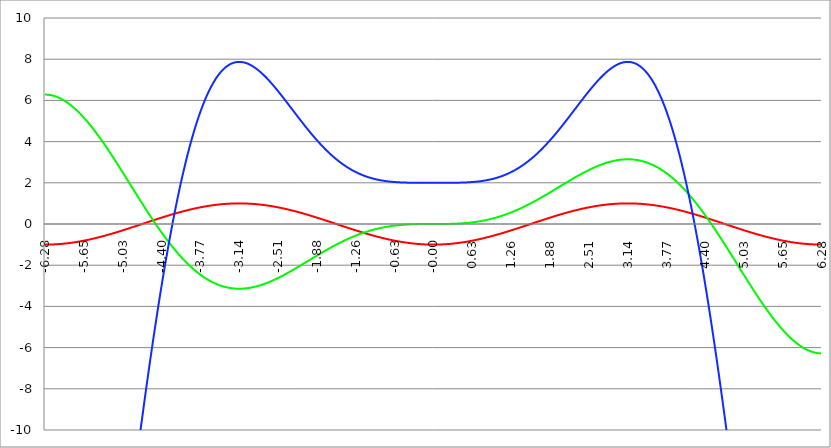
| Category | Series 1 | Series 0 | Series 2 |
|---|---|---|---|
| -6.283185307179586 | -1 | 6.283 | -37.478 |
| -6.276902121872407 | -1 | 6.283 | -37.478 |
| -6.270618936565228 | -1 | 6.283 | -37.475 |
| -6.264335751258049 | -1 | 6.282 | -37.471 |
| -6.25805256595087 | -1 | 6.281 | -37.466 |
| -6.25176938064369 | -1 | 6.28 | -37.459 |
| -6.245486195336511 | -0.999 | 6.279 | -37.451 |
| -6.23920301002933 | -0.999 | 6.277 | -37.441 |
| -6.232919824722153 | -0.999 | 6.275 | -37.429 |
| -6.226636639414973 | -0.998 | 6.273 | -37.416 |
| -6.220353454107794 | -0.998 | 6.271 | -37.402 |
| -6.214070268800615 | -0.998 | 6.268 | -37.386 |
| -6.207787083493435 | -0.997 | 6.265 | -37.368 |
| -6.201503898186257 | -0.997 | 6.262 | -37.349 |
| -6.195220712879077 | -0.996 | 6.259 | -37.329 |
| -6.188937527571898 | -0.996 | 6.256 | -37.307 |
| -6.182654342264719 | -0.995 | 6.252 | -37.283 |
| -6.17637115695754 | -0.994 | 6.248 | -37.258 |
| -6.170087971650361 | -0.994 | 6.244 | -37.232 |
| -6.163804786343182 | -0.993 | 6.239 | -37.204 |
| -6.157521601036002 | -0.992 | 6.234 | -37.175 |
| -6.151238415728823 | -0.991 | 6.229 | -37.145 |
| -6.144955230421644 | -0.99 | 6.224 | -37.113 |
| -6.138672045114464 | -0.99 | 6.219 | -37.079 |
| -6.132388859807286 | -0.989 | 6.213 | -37.045 |
| -6.126105674500106 | -0.988 | 6.207 | -37.008 |
| -6.119822489192927 | -0.987 | 6.201 | -36.971 |
| -6.113539303885748 | -0.986 | 6.195 | -36.932 |
| -6.107256118578569 | -0.985 | 6.188 | -36.892 |
| -6.10097293327139 | -0.983 | 6.181 | -36.85 |
| -6.09468974796421 | -0.982 | 6.174 | -36.807 |
| -6.088406562657031 | -0.981 | 6.167 | -36.762 |
| -6.082123377349852 | -0.98 | 6.159 | -36.717 |
| -6.075840192042672 | -0.979 | 6.152 | -36.67 |
| -6.069557006735494 | -0.977 | 6.144 | -36.621 |
| -6.063273821428314 | -0.976 | 6.135 | -36.571 |
| -6.056990636121135 | -0.975 | 6.127 | -36.52 |
| -6.050707450813956 | -0.973 | 6.118 | -36.468 |
| -6.044424265506777 | -0.972 | 6.109 | -36.414 |
| -6.038141080199597 | -0.97 | 6.1 | -36.359 |
| -6.031857894892418 | -0.969 | 6.091 | -36.303 |
| -6.025574709585239 | -0.967 | 6.082 | -36.246 |
| -6.01929152427806 | -0.965 | 6.072 | -36.187 |
| -6.013008338970881 | -0.964 | 6.062 | -36.127 |
| -6.006725153663701 | -0.962 | 6.052 | -36.066 |
| -6.000441968356522 | -0.96 | 6.041 | -36.003 |
| -5.994158783049343 | -0.959 | 6.031 | -35.939 |
| -5.987875597742164 | -0.957 | 6.02 | -35.875 |
| -5.981592412434984 | -0.955 | 6.009 | -35.808 |
| -5.975309227127805 | -0.953 | 5.997 | -35.741 |
| -5.969026041820626 | -0.951 | 5.986 | -35.672 |
| -5.962742856513447 | -0.949 | 5.974 | -35.603 |
| -5.956459671206268 | -0.947 | 5.962 | -35.532 |
| -5.950176485899088 | -0.945 | 5.95 | -35.46 |
| -5.94389330059191 | -0.943 | 5.938 | -35.386 |
| -5.93761011528473 | -0.941 | 5.925 | -35.312 |
| -5.931326929977551 | -0.939 | 5.913 | -35.236 |
| -5.925043744670372 | -0.937 | 5.9 | -35.159 |
| -5.918760559363193 | -0.934 | 5.886 | -35.082 |
| -5.912477374056014 | -0.932 | 5.873 | -35.003 |
| -5.906194188748834 | -0.93 | 5.86 | -34.922 |
| -5.899911003441655 | -0.927 | 5.846 | -34.841 |
| -5.893627818134476 | -0.925 | 5.832 | -34.759 |
| -5.887344632827297 | -0.923 | 5.818 | -34.675 |
| -5.881061447520117 | -0.92 | 5.803 | -34.591 |
| -5.874778262212938 | -0.918 | 5.789 | -34.505 |
| -5.868495076905759 | -0.915 | 5.774 | -34.419 |
| -5.86221189159858 | -0.913 | 5.759 | -34.331 |
| -5.855928706291401 | -0.91 | 5.744 | -34.242 |
| -5.849645520984221 | -0.907 | 5.729 | -34.152 |
| -5.843362335677042 | -0.905 | 5.713 | -34.062 |
| -5.837079150369863 | -0.902 | 5.697 | -33.97 |
| -5.830795965062684 | -0.899 | 5.681 | -33.877 |
| -5.824512779755505 | -0.897 | 5.665 | -33.783 |
| -5.818229594448325 | -0.894 | 5.649 | -33.688 |
| -5.811946409141146 | -0.891 | 5.632 | -33.592 |
| -5.805663223833967 | -0.888 | 5.616 | -33.495 |
| -5.799380038526788 | -0.885 | 5.599 | -33.398 |
| -5.793096853219609 | -0.882 | 5.582 | -33.299 |
| -5.78681366791243 | -0.879 | 5.565 | -33.199 |
| -5.780530482605251 | -0.876 | 5.547 | -33.098 |
| -5.774247297298071 | -0.873 | 5.53 | -32.997 |
| -5.767964111990892 | -0.87 | 5.512 | -32.894 |
| -5.761680926683713 | -0.867 | 5.494 | -32.791 |
| -5.755397741376534 | -0.864 | 5.476 | -32.686 |
| -5.749114556069355 | -0.861 | 5.458 | -32.581 |
| -5.742831370762175 | -0.858 | 5.439 | -32.475 |
| -5.736548185454996 | -0.854 | 5.42 | -32.368 |
| -5.730265000147816 | -0.851 | 5.402 | -32.26 |
| -5.723981814840638 | -0.848 | 5.383 | -32.151 |
| -5.717698629533459 | -0.844 | 5.363 | -32.042 |
| -5.711415444226279 | -0.841 | 5.344 | -31.931 |
| -5.7051322589191 | -0.838 | 5.325 | -31.82 |
| -5.698849073611921 | -0.834 | 5.305 | -31.708 |
| -5.692565888304742 | -0.831 | 5.285 | -31.595 |
| -5.686282702997562 | -0.827 | 5.265 | -31.481 |
| -5.679999517690383 | -0.824 | 5.245 | -31.366 |
| -5.673716332383204 | -0.82 | 5.225 | -31.251 |
| -5.667433147076025 | -0.816 | 5.204 | -31.135 |
| -5.661149961768846 | -0.813 | 5.183 | -31.018 |
| -5.654866776461667 | -0.809 | 5.163 | -30.9 |
| -5.648583591154487 | -0.805 | 5.142 | -30.782 |
| -5.642300405847308 | -0.802 | 5.121 | -30.662 |
| -5.63601722054013 | -0.798 | 5.099 | -30.542 |
| -5.62973403523295 | -0.794 | 5.078 | -30.422 |
| -5.623450849925771 | -0.79 | 5.056 | -30.3 |
| -5.617167664618591 | -0.786 | 5.035 | -30.178 |
| -5.610884479311412 | -0.782 | 5.013 | -30.055 |
| -5.604601294004233 | -0.778 | 4.991 | -29.932 |
| -5.598318108697054 | -0.775 | 4.968 | -29.807 |
| -5.592034923389875 | -0.771 | 4.946 | -29.683 |
| -5.585751738082695 | -0.766 | 4.924 | -29.557 |
| -5.579468552775516 | -0.762 | 4.901 | -29.431 |
| -5.573185367468337 | -0.758 | 4.878 | -29.304 |
| -5.566902182161157 | -0.754 | 4.855 | -29.176 |
| -5.560618996853979 | -0.75 | 4.832 | -29.048 |
| -5.5543358115468 | -0.746 | 4.809 | -28.919 |
| -5.54805262623962 | -0.742 | 4.786 | -28.79 |
| -5.54176944093244 | -0.738 | 4.762 | -28.66 |
| -5.535486255625262 | -0.733 | 4.739 | -28.529 |
| -5.529203070318083 | -0.729 | 4.715 | -28.398 |
| -5.522919885010904 | -0.725 | 4.691 | -28.266 |
| -5.516636699703724 | -0.72 | 4.667 | -28.134 |
| -5.510353514396545 | -0.716 | 4.643 | -28.001 |
| -5.504070329089366 | -0.712 | 4.619 | -27.868 |
| -5.497787143782186 | -0.707 | 4.595 | -27.734 |
| -5.491503958475008 | -0.703 | 4.57 | -27.599 |
| -5.485220773167828 | -0.698 | 4.546 | -27.464 |
| -5.47893758786065 | -0.694 | 4.521 | -27.328 |
| -5.47265440255347 | -0.689 | 4.496 | -27.192 |
| -5.466371217246291 | -0.685 | 4.471 | -27.056 |
| -5.460088031939112 | -0.68 | 4.446 | -26.919 |
| -5.453804846631932 | -0.675 | 4.421 | -26.781 |
| -5.447521661324753 | -0.671 | 4.395 | -26.643 |
| -5.441238476017574 | -0.666 | 4.37 | -26.504 |
| -5.434955290710395 | -0.661 | 4.344 | -26.365 |
| -5.428672105403215 | -0.657 | 4.319 | -26.226 |
| -5.422388920096036 | -0.652 | 4.293 | -26.086 |
| -5.416105734788857 | -0.647 | 4.267 | -25.946 |
| -5.409822549481678 | -0.642 | 4.241 | -25.805 |
| -5.403539364174499 | -0.637 | 4.215 | -25.664 |
| -5.39725617886732 | -0.633 | 4.189 | -25.522 |
| -5.39097299356014 | -0.628 | 4.162 | -25.38 |
| -5.384689808252961 | -0.623 | 4.136 | -25.238 |
| -5.378406622945782 | -0.618 | 4.109 | -25.095 |
| -5.372123437638603 | -0.613 | 4.083 | -24.952 |
| -5.365840252331424 | -0.608 | 4.056 | -24.809 |
| -5.359557067024244 | -0.603 | 4.029 | -24.665 |
| -5.353273881717065 | -0.598 | 4.002 | -24.521 |
| -5.346990696409886 | -0.593 | 3.975 | -24.376 |
| -5.340707511102707 | -0.588 | 3.948 | -24.231 |
| -5.334424325795528 | -0.583 | 3.921 | -24.086 |
| -5.328141140488348 | -0.578 | 3.894 | -23.941 |
| -5.32185795518117 | -0.572 | 3.866 | -23.795 |
| -5.31557476987399 | -0.567 | 3.839 | -23.649 |
| -5.30929158456681 | -0.562 | 3.811 | -23.503 |
| -5.303008399259631 | -0.557 | 3.784 | -23.356 |
| -5.296725213952453 | -0.552 | 3.756 | -23.209 |
| -5.290442028645273 | -0.546 | 3.728 | -23.062 |
| -5.284158843338094 | -0.541 | 3.7 | -22.914 |
| -5.277875658030915 | -0.536 | 3.672 | -22.767 |
| -5.271592472723735 | -0.531 | 3.644 | -22.619 |
| -5.265309287416557 | -0.525 | 3.616 | -22.471 |
| -5.259026102109377 | -0.52 | 3.588 | -22.322 |
| -5.252742916802198 | -0.514 | 3.56 | -22.174 |
| -5.246459731495019 | -0.509 | 3.531 | -22.025 |
| -5.24017654618784 | -0.504 | 3.503 | -21.876 |
| -5.23389336088066 | -0.498 | 3.475 | -21.727 |
| -5.227610175573481 | -0.493 | 3.446 | -21.578 |
| -5.221326990266302 | -0.487 | 3.417 | -21.428 |
| -5.215043804959122 | -0.482 | 3.389 | -21.279 |
| -5.208760619651944 | -0.476 | 3.36 | -21.129 |
| -5.202477434344764 | -0.471 | 3.331 | -20.979 |
| -5.196194249037585 | -0.465 | 3.302 | -20.829 |
| -5.189911063730406 | -0.46 | 3.273 | -20.678 |
| -5.183627878423227 | -0.454 | 3.244 | -20.528 |
| -5.177344693116048 | -0.448 | 3.215 | -20.378 |
| -5.171061507808868 | -0.443 | 3.186 | -20.227 |
| -5.164778322501689 | -0.437 | 3.157 | -20.076 |
| -5.15849513719451 | -0.431 | 3.128 | -19.925 |
| -5.152211951887331 | -0.426 | 3.099 | -19.775 |
| -5.145928766580152 | -0.42 | 3.069 | -19.624 |
| -5.139645581272972 | -0.414 | 3.04 | -19.473 |
| -5.133362395965793 | -0.409 | 3.01 | -19.322 |
| -5.127079210658614 | -0.403 | 2.981 | -19.17 |
| -5.120796025351435 | -0.397 | 2.951 | -19.019 |
| -5.114512840044256 | -0.391 | 2.922 | -18.868 |
| -5.108229654737076 | -0.386 | 2.892 | -18.717 |
| -5.101946469429897 | -0.38 | 2.863 | -18.565 |
| -5.095663284122718 | -0.374 | 2.833 | -18.414 |
| -5.08938009881554 | -0.368 | 2.803 | -18.263 |
| -5.08309691350836 | -0.362 | 2.774 | -18.111 |
| -5.07681372820118 | -0.356 | 2.744 | -17.96 |
| -5.070530542894002 | -0.351 | 2.714 | -17.809 |
| -5.064247357586822 | -0.345 | 2.684 | -17.658 |
| -5.057964172279643 | -0.339 | 2.654 | -17.506 |
| -5.051680986972464 | -0.333 | 2.624 | -17.355 |
| -5.045397801665285 | -0.327 | 2.594 | -17.204 |
| -5.039114616358106 | -0.321 | 2.564 | -17.053 |
| -5.032831431050926 | -0.315 | 2.534 | -16.902 |
| -5.026548245743747 | -0.309 | 2.504 | -16.751 |
| -5.020265060436568 | -0.303 | 2.474 | -16.6 |
| -5.013981875129389 | -0.297 | 2.444 | -16.449 |
| -5.00769868982221 | -0.291 | 2.414 | -16.298 |
| -5.00141550451503 | -0.285 | 2.384 | -16.147 |
| -4.995132319207851 | -0.279 | 2.354 | -15.997 |
| -4.98884913390067 | -0.273 | 2.324 | -15.846 |
| -4.982565948593493 | -0.267 | 2.294 | -15.696 |
| -4.976282763286313 | -0.261 | 2.263 | -15.546 |
| -4.969999577979134 | -0.255 | 2.233 | -15.396 |
| -4.963716392671955 | -0.249 | 2.203 | -15.246 |
| -4.957433207364776 | -0.243 | 2.173 | -15.096 |
| -4.951150022057597 | -0.236 | 2.143 | -14.946 |
| -4.944866836750418 | -0.23 | 2.112 | -14.796 |
| -4.938583651443238 | -0.224 | 2.082 | -14.647 |
| -4.932300466136059 | -0.218 | 2.052 | -14.498 |
| -4.92601728082888 | -0.212 | 2.022 | -14.349 |
| -4.9197340955217 | -0.206 | 1.991 | -14.2 |
| -4.913450910214521 | -0.2 | 1.961 | -14.051 |
| -4.907167724907342 | -0.194 | 1.931 | -13.902 |
| -4.900884539600163 | -0.187 | 1.901 | -13.754 |
| -4.894601354292984 | -0.181 | 1.87 | -13.606 |
| -4.888318168985805 | -0.175 | 1.84 | -13.458 |
| -4.882034983678625 | -0.169 | 1.81 | -13.31 |
| -4.875751798371446 | -0.163 | 1.78 | -13.163 |
| -4.869468613064267 | -0.156 | 1.749 | -13.015 |
| -4.863185427757088 | -0.15 | 1.719 | -12.868 |
| -4.856902242449909 | -0.144 | 1.689 | -12.722 |
| -4.85061905714273 | -0.138 | 1.659 | -12.575 |
| -4.84433587183555 | -0.132 | 1.629 | -12.429 |
| -4.838052686528371 | -0.125 | 1.598 | -12.283 |
| -4.831769501221192 | -0.119 | 1.568 | -12.137 |
| -4.825486315914013 | -0.113 | 1.538 | -11.991 |
| -4.819203130606833 | -0.107 | 1.508 | -11.846 |
| -4.812919945299654 | -0.1 | 1.478 | -11.701 |
| -4.806636759992475 | -0.094 | 1.448 | -11.557 |
| -4.800353574685296 | -0.088 | 1.418 | -11.412 |
| -4.794070389378117 | -0.082 | 1.388 | -11.268 |
| -4.787787204070938 | -0.075 | 1.358 | -11.124 |
| -4.781504018763758 | -0.069 | 1.328 | -10.981 |
| -4.77522083345658 | -0.063 | 1.298 | -10.838 |
| -4.7689376481494 | -0.057 | 1.268 | -10.695 |
| -4.762654462842221 | -0.05 | 1.238 | -10.552 |
| -4.756371277535042 | -0.044 | 1.208 | -10.41 |
| -4.750088092227862 | -0.038 | 1.178 | -10.268 |
| -4.743804906920683 | -0.031 | 1.149 | -10.127 |
| -4.737521721613504 | -0.025 | 1.119 | -9.986 |
| -4.731238536306324 | -0.019 | 1.089 | -9.845 |
| -4.724955350999146 | -0.013 | 1.059 | -9.705 |
| -4.718672165691966 | -0.006 | 1.03 | -9.564 |
| -4.712388980384787 | 0 | 1 | -9.425 |
| -4.706105795077608 | 0.006 | 0.97 | -9.285 |
| -4.699822609770429 | 0.013 | 0.941 | -9.146 |
| -4.69353942446325 | 0.019 | 0.911 | -9.008 |
| -4.68725623915607 | 0.025 | 0.882 | -8.87 |
| -4.680973053848891 | 0.031 | 0.852 | -8.732 |
| -4.674689868541712 | 0.038 | 0.823 | -8.594 |
| -4.668406683234533 | 0.044 | 0.794 | -8.457 |
| -4.662123497927354 | 0.05 | 0.764 | -8.321 |
| -4.655840312620174 | 0.057 | 0.735 | -8.185 |
| -4.649557127312995 | 0.063 | 0.706 | -8.049 |
| -4.643273942005816 | 0.069 | 0.677 | -7.914 |
| -4.636990756698637 | 0.075 | 0.648 | -7.779 |
| -4.630707571391458 | 0.082 | 0.619 | -7.644 |
| -4.624424386084279 | 0.088 | 0.59 | -7.51 |
| -4.618141200777099 | 0.094 | 0.561 | -7.376 |
| -4.61185801546992 | 0.1 | 0.532 | -7.243 |
| -4.605574830162741 | 0.107 | 0.503 | -7.111 |
| -4.599291644855561 | 0.113 | 0.475 | -6.978 |
| -4.593008459548383 | 0.119 | 0.446 | -6.846 |
| -4.586725274241203 | 0.125 | 0.417 | -6.715 |
| -4.580442088934024 | 0.132 | 0.389 | -6.584 |
| -4.574158903626845 | 0.138 | 0.36 | -6.454 |
| -4.567875718319666 | 0.144 | 0.332 | -6.324 |
| -4.561592533012487 | 0.15 | 0.303 | -6.194 |
| -4.555309347705307 | 0.156 | 0.275 | -6.065 |
| -4.549026162398128 | 0.163 | 0.247 | -5.937 |
| -4.542742977090949 | 0.169 | 0.219 | -5.809 |
| -4.53645979178377 | 0.175 | 0.191 | -5.681 |
| -4.530176606476591 | 0.181 | 0.163 | -5.554 |
| -4.523893421169412 | 0.187 | 0.135 | -5.427 |
| -4.517610235862232 | 0.194 | 0.107 | -5.301 |
| -4.511327050555053 | 0.2 | 0.079 | -5.176 |
| -4.505043865247874 | 0.206 | 0.051 | -5.051 |
| -4.498760679940694 | 0.212 | 0.023 | -4.926 |
| -4.492477494633515 | 0.218 | -0.004 | -4.802 |
| -4.486194309326336 | 0.224 | -0.032 | -4.679 |
| -4.479911124019157 | 0.23 | -0.059 | -4.556 |
| -4.473627938711977 | 0.236 | -0.086 | -4.433 |
| -4.467344753404799 | 0.243 | -0.114 | -4.311 |
| -4.46106156809762 | 0.249 | -0.141 | -4.19 |
| -4.45477838279044 | 0.255 | -0.168 | -4.069 |
| -4.44849519748326 | 0.261 | -0.195 | -3.949 |
| -4.442212012176082 | 0.267 | -0.222 | -3.829 |
| -4.435928826868903 | 0.273 | -0.249 | -3.71 |
| -4.429645641561723 | 0.279 | -0.276 | -3.591 |
| -4.423362456254544 | 0.285 | -0.302 | -3.473 |
| -4.417079270947365 | 0.291 | -0.329 | -3.356 |
| -4.410796085640185 | 0.297 | -0.355 | -3.239 |
| -4.404512900333007 | 0.303 | -0.382 | -3.122 |
| -4.398229715025827 | 0.309 | -0.408 | -3.006 |
| -4.391946529718648 | 0.315 | -0.434 | -2.891 |
| -4.38566334441147 | 0.321 | -0.46 | -2.776 |
| -4.37938015910429 | 0.327 | -0.487 | -2.662 |
| -4.373096973797111 | 0.333 | -0.512 | -2.548 |
| -4.366813788489932 | 0.339 | -0.538 | -2.435 |
| -4.360530603182752 | 0.345 | -0.564 | -2.323 |
| -4.354247417875573 | 0.351 | -0.59 | -2.211 |
| -4.347964232568394 | 0.356 | -0.615 | -2.1 |
| -4.341681047261215 | 0.362 | -0.641 | -1.989 |
| -4.335397861954035 | 0.368 | -0.666 | -1.879 |
| -4.329114676646856 | 0.374 | -0.691 | -1.769 |
| -4.322831491339677 | 0.38 | -0.717 | -1.661 |
| -4.316548306032498 | 0.386 | -0.742 | -1.552 |
| -4.310265120725319 | 0.391 | -0.767 | -1.445 |
| -4.30398193541814 | 0.397 | -0.792 | -1.337 |
| -4.29769875011096 | 0.403 | -0.816 | -1.231 |
| -4.291415564803781 | 0.409 | -0.841 | -1.125 |
| -4.285132379496602 | 0.414 | -0.866 | -1.02 |
| -4.278849194189422 | 0.42 | -0.89 | -0.915 |
| -4.272566008882244 | 0.426 | -0.914 | -0.811 |
| -4.266282823575064 | 0.431 | -0.939 | -0.707 |
| -4.259999638267885 | 0.437 | -0.963 | -0.605 |
| -4.253716452960706 | 0.443 | -0.987 | -0.502 |
| -4.247433267653527 | 0.448 | -1.011 | -0.401 |
| -4.241150082346347 | 0.454 | -1.034 | -0.3 |
| -4.234866897039168 | 0.46 | -1.058 | -0.199 |
| -4.228583711731989 | 0.465 | -1.082 | -0.1 |
| -4.22230052642481 | 0.471 | -1.105 | 0 |
| -4.216017341117631 | 0.476 | -1.129 | 0.098 |
| -4.209734155810452 | 0.482 | -1.152 | 0.196 |
| -4.203450970503273 | 0.487 | -1.175 | 0.293 |
| -4.197167785196093 | 0.493 | -1.198 | 0.39 |
| -4.190884599888914 | 0.498 | -1.221 | 0.486 |
| -4.184601414581734 | 0.504 | -1.244 | 0.581 |
| -4.178318229274556 | 0.509 | -1.266 | 0.676 |
| -4.172035043967377 | 0.514 | -1.289 | 0.77 |
| -4.165751858660197 | 0.52 | -1.311 | 0.864 |
| -4.159468673353018 | 0.525 | -1.333 | 0.956 |
| -4.153185488045839 | 0.531 | -1.356 | 1.049 |
| -4.14690230273866 | 0.536 | -1.378 | 1.14 |
| -4.140619117431481 | 0.541 | -1.4 | 1.231 |
| -4.134335932124301 | 0.546 | -1.421 | 1.321 |
| -4.128052746817122 | 0.552 | -1.443 | 1.411 |
| -4.121769561509943 | 0.557 | -1.465 | 1.5 |
| -4.115486376202764 | 0.562 | -1.486 | 1.588 |
| -4.109203190895584 | 0.567 | -1.507 | 1.676 |
| -4.102920005588405 | 0.572 | -1.529 | 1.763 |
| -4.096636820281226 | 0.578 | -1.55 | 1.849 |
| -4.090353634974047 | 0.583 | -1.571 | 1.935 |
| -4.084070449666868 | 0.588 | -1.592 | 2.02 |
| -4.077787264359689 | 0.593 | -1.612 | 2.105 |
| -4.071504079052509 | 0.598 | -1.633 | 2.189 |
| -4.06522089374533 | 0.603 | -1.653 | 2.272 |
| -4.058937708438151 | 0.608 | -1.674 | 2.354 |
| -4.052654523130972 | 0.613 | -1.694 | 2.436 |
| -4.046371337823793 | 0.618 | -1.714 | 2.517 |
| -4.040088152516613 | 0.623 | -1.734 | 2.598 |
| -4.033804967209434 | 0.628 | -1.754 | 2.678 |
| -4.027521781902255 | 0.633 | -1.773 | 2.757 |
| -4.021238596595076 | 0.637 | -1.793 | 2.836 |
| -4.014955411287897 | 0.642 | -1.812 | 2.914 |
| -4.008672225980717 | 0.647 | -1.831 | 2.991 |
| -4.002389040673538 | 0.652 | -1.851 | 3.068 |
| -3.996105855366359 | 0.657 | -1.87 | 3.144 |
| -3.989822670059179 | 0.661 | -1.888 | 3.219 |
| -3.983539484752 | 0.666 | -1.907 | 3.294 |
| -3.97725629944482 | 0.671 | -1.926 | 3.368 |
| -3.97097311413764 | 0.675 | -1.944 | 3.441 |
| -3.96468992883046 | 0.68 | -1.963 | 3.514 |
| -3.958406743523281 | 0.685 | -1.981 | 3.586 |
| -3.952123558216101 | 0.689 | -1.999 | 3.657 |
| -3.945840372908922 | 0.694 | -2.017 | 3.728 |
| -3.939557187601742 | 0.698 | -2.035 | 3.798 |
| -3.933274002294562 | 0.703 | -2.052 | 3.868 |
| -3.926990816987382 | 0.707 | -2.07 | 3.937 |
| -3.920707631680203 | 0.712 | -2.087 | 4.005 |
| -3.914424446373023 | 0.716 | -2.104 | 4.072 |
| -3.908141261065844 | 0.72 | -2.121 | 4.139 |
| -3.901858075758664 | 0.725 | -2.138 | 4.206 |
| -3.895574890451484 | 0.729 | -2.155 | 4.271 |
| -3.889291705144305 | 0.733 | -2.172 | 4.336 |
| -3.883008519837125 | 0.738 | -2.188 | 4.4 |
| -3.876725334529945 | 0.742 | -2.205 | 4.464 |
| -3.870442149222766 | 0.746 | -2.221 | 4.527 |
| -3.864158963915586 | 0.75 | -2.237 | 4.589 |
| -3.857875778608407 | 0.754 | -2.253 | 4.651 |
| -3.851592593301227 | 0.758 | -2.269 | 4.712 |
| -3.845309407994047 | 0.762 | -2.285 | 4.773 |
| -3.839026222686868 | 0.766 | -2.3 | 4.832 |
| -3.832743037379688 | 0.771 | -2.316 | 4.892 |
| -3.826459852072508 | 0.775 | -2.331 | 4.95 |
| -3.820176666765329 | 0.778 | -2.346 | 5.008 |
| -3.813893481458149 | 0.782 | -2.361 | 5.065 |
| -3.807610296150969 | 0.786 | -2.376 | 5.122 |
| -3.80132711084379 | 0.79 | -2.391 | 5.178 |
| -3.79504392553661 | 0.794 | -2.405 | 5.233 |
| -3.78876074022943 | 0.798 | -2.42 | 5.288 |
| -3.782477554922251 | 0.802 | -2.434 | 5.342 |
| -3.776194369615071 | 0.805 | -2.448 | 5.395 |
| -3.769911184307892 | 0.809 | -2.462 | 5.448 |
| -3.763627999000712 | 0.813 | -2.476 | 5.5 |
| -3.757344813693532 | 0.816 | -2.49 | 5.552 |
| -3.751061628386352 | 0.82 | -2.503 | 5.603 |
| -3.744778443079173 | 0.824 | -2.517 | 5.653 |
| -3.738495257771993 | 0.827 | -2.53 | 5.703 |
| -3.732212072464814 | 0.831 | -2.543 | 5.752 |
| -3.725928887157634 | 0.834 | -2.556 | 5.8 |
| -3.719645701850454 | 0.838 | -2.569 | 5.848 |
| -3.713362516543275 | 0.841 | -2.582 | 5.895 |
| -3.707079331236095 | 0.844 | -2.594 | 5.942 |
| -3.700796145928915 | 0.848 | -2.607 | 5.988 |
| -3.694512960621736 | 0.851 | -2.619 | 6.033 |
| -3.688229775314556 | 0.854 | -2.631 | 6.078 |
| -3.681946590007376 | 0.858 | -2.643 | 6.122 |
| -3.675663404700197 | 0.861 | -2.655 | 6.165 |
| -3.669380219393017 | 0.864 | -2.666 | 6.208 |
| -3.663097034085838 | 0.867 | -2.678 | 6.251 |
| -3.656813848778658 | 0.87 | -2.689 | 6.292 |
| -3.650530663471478 | 0.873 | -2.701 | 6.333 |
| -3.644247478164299 | 0.876 | -2.712 | 6.374 |
| -3.63796429285712 | 0.879 | -2.723 | 6.414 |
| -3.631681107549939 | 0.882 | -2.733 | 6.453 |
| -3.62539792224276 | 0.885 | -2.744 | 6.492 |
| -3.61911473693558 | 0.888 | -2.755 | 6.53 |
| -3.612831551628401 | 0.891 | -2.765 | 6.568 |
| -3.606548366321221 | 0.894 | -2.775 | 6.604 |
| -3.600265181014041 | 0.897 | -2.785 | 6.641 |
| -3.593981995706862 | 0.899 | -2.795 | 6.677 |
| -3.587698810399682 | 0.902 | -2.805 | 6.712 |
| -3.581415625092502 | 0.905 | -2.815 | 6.746 |
| -3.575132439785323 | 0.907 | -2.824 | 6.78 |
| -3.568849254478143 | 0.91 | -2.834 | 6.814 |
| -3.562566069170964 | 0.913 | -2.843 | 6.847 |
| -3.556282883863784 | 0.915 | -2.852 | 6.879 |
| -3.549999698556604 | 0.918 | -2.861 | 6.911 |
| -3.543716513249425 | 0.92 | -2.87 | 6.942 |
| -3.537433327942245 | 0.923 | -2.878 | 6.973 |
| -3.531150142635065 | 0.925 | -2.887 | 7.003 |
| -3.524866957327886 | 0.927 | -2.895 | 7.032 |
| -3.518583772020706 | 0.93 | -2.903 | 7.061 |
| -3.512300586713526 | 0.932 | -2.911 | 7.089 |
| -3.506017401406347 | 0.934 | -2.919 | 7.117 |
| -3.499734216099167 | 0.937 | -2.927 | 7.144 |
| -3.493451030791987 | 0.939 | -2.935 | 7.171 |
| -3.487167845484808 | 0.941 | -2.942 | 7.197 |
| -3.480884660177628 | 0.943 | -2.95 | 7.223 |
| -3.474601474870449 | 0.945 | -2.957 | 7.248 |
| -3.468318289563269 | 0.947 | -2.964 | 7.272 |
| -3.462035104256089 | 0.949 | -2.971 | 7.296 |
| -3.45575191894891 | 0.951 | -2.978 | 7.32 |
| -3.44946873364173 | 0.953 | -2.984 | 7.343 |
| -3.44318554833455 | 0.955 | -2.991 | 7.365 |
| -3.436902363027371 | 0.957 | -2.997 | 7.387 |
| -3.430619177720191 | 0.959 | -3.003 | 7.408 |
| -3.424335992413011 | 0.96 | -3.009 | 7.429 |
| -3.418052807105832 | 0.962 | -3.015 | 7.449 |
| -3.411769621798652 | 0.964 | -3.021 | 7.469 |
| -3.405486436491473 | 0.965 | -3.027 | 7.489 |
| -3.399203251184293 | 0.967 | -3.032 | 7.507 |
| -3.392920065877113 | 0.969 | -3.038 | 7.526 |
| -3.386636880569934 | 0.97 | -3.043 | 7.543 |
| -3.380353695262754 | 0.972 | -3.048 | 7.56 |
| -3.374070509955574 | 0.973 | -3.053 | 7.577 |
| -3.367787324648395 | 0.975 | -3.058 | 7.593 |
| -3.361504139341215 | 0.976 | -3.062 | 7.609 |
| -3.355220954034035 | 0.977 | -3.067 | 7.624 |
| -3.348937768726855 | 0.979 | -3.071 | 7.639 |
| -3.342654583419676 | 0.98 | -3.076 | 7.653 |
| -3.336371398112496 | 0.981 | -3.08 | 7.667 |
| -3.330088212805317 | 0.982 | -3.084 | 7.68 |
| -3.323805027498137 | 0.983 | -3.088 | 7.693 |
| -3.317521842190957 | 0.985 | -3.091 | 7.706 |
| -3.311238656883778 | 0.986 | -3.095 | 7.718 |
| -3.304955471576598 | 0.987 | -3.098 | 7.729 |
| -3.298672286269419 | 0.988 | -3.102 | 7.74 |
| -3.292389100962239 | 0.989 | -3.105 | 7.75 |
| -3.286105915655059 | 0.99 | -3.108 | 7.76 |
| -3.27982273034788 | 0.99 | -3.111 | 7.77 |
| -3.2735395450407 | 0.991 | -3.114 | 7.779 |
| -3.26725635973352 | 0.992 | -3.116 | 7.788 |
| -3.260973174426341 | 0.993 | -3.119 | 7.796 |
| -3.254689989119161 | 0.994 | -3.121 | 7.803 |
| -3.248406803811982 | 0.994 | -3.123 | 7.811 |
| -3.242123618504802 | 0.995 | -3.125 | 7.818 |
| -3.235840433197622 | 0.996 | -3.127 | 7.824 |
| -3.229557247890442 | 0.996 | -3.129 | 7.83 |
| -3.223274062583263 | 0.997 | -3.131 | 7.836 |
| -3.216990877276083 | 0.997 | -3.133 | 7.841 |
| -3.210707691968904 | 0.998 | -3.134 | 7.845 |
| -3.204424506661724 | 0.998 | -3.135 | 7.85 |
| -3.198141321354544 | 0.998 | -3.137 | 7.853 |
| -3.191858136047365 | 0.999 | -3.138 | 7.857 |
| -3.185574950740185 | 0.999 | -3.139 | 7.86 |
| -3.179291765433005 | 0.999 | -3.139 | 7.862 |
| -3.173008580125826 | 1 | -3.14 | 7.865 |
| -3.166725394818646 | 1 | -3.141 | 7.866 |
| -3.160442209511467 | 1 | -3.141 | 7.868 |
| -3.154159024204287 | 1 | -3.141 | 7.869 |
| -3.147875838897107 | 1 | -3.142 | 7.869 |
| -3.141592653589928 | 1 | -3.142 | 7.87 |
| -3.135309468282748 | 1 | -3.142 | 7.869 |
| -3.129026282975568 | 1 | -3.141 | 7.869 |
| -3.122743097668389 | 1 | -3.141 | 7.868 |
| -3.116459912361209 | 1 | -3.141 | 7.867 |
| -3.110176727054029 | 1 | -3.14 | 7.865 |
| -3.10389354174685 | 0.999 | -3.139 | 7.863 |
| -3.09761035643967 | 0.999 | -3.139 | 7.86 |
| -3.09132717113249 | 0.999 | -3.138 | 7.857 |
| -3.085043985825311 | 0.998 | -3.137 | 7.854 |
| -3.078760800518131 | 0.998 | -3.135 | 7.851 |
| -3.072477615210952 | 0.998 | -3.134 | 7.847 |
| -3.066194429903772 | 0.997 | -3.133 | 7.842 |
| -3.059911244596592 | 0.997 | -3.131 | 7.838 |
| -3.053628059289413 | 0.996 | -3.13 | 7.833 |
| -3.047344873982233 | 0.996 | -3.128 | 7.828 |
| -3.041061688675053 | 0.995 | -3.126 | 7.822 |
| -3.034778503367874 | 0.994 | -3.124 | 7.816 |
| -3.028495318060694 | 0.994 | -3.122 | 7.81 |
| -3.022212132753515 | 0.993 | -3.12 | 7.803 |
| -3.015928947446335 | 0.992 | -3.117 | 7.796 |
| -3.009645762139155 | 0.991 | -3.115 | 7.789 |
| -3.003362576831975 | 0.99 | -3.113 | 7.781 |
| -2.997079391524796 | 0.99 | -3.11 | 7.773 |
| -2.990796206217616 | 0.989 | -3.107 | 7.765 |
| -2.984513020910436 | 0.988 | -3.104 | 7.756 |
| -2.978229835603257 | 0.987 | -3.101 | 7.747 |
| -2.971946650296077 | 0.986 | -3.098 | 7.738 |
| -2.965663464988898 | 0.985 | -3.095 | 7.728 |
| -2.959380279681718 | 0.983 | -3.092 | 7.719 |
| -2.953097094374538 | 0.982 | -3.088 | 7.708 |
| -2.946813909067359 | 0.981 | -3.085 | 7.698 |
| -2.94053072376018 | 0.98 | -3.081 | 7.687 |
| -2.934247538453 | 0.979 | -3.077 | 7.676 |
| -2.92796435314582 | 0.977 | -3.073 | 7.665 |
| -2.92168116783864 | 0.976 | -3.069 | 7.653 |
| -2.915397982531461 | 0.975 | -3.065 | 7.642 |
| -2.909114797224281 | 0.973 | -3.061 | 7.63 |
| -2.902831611917101 | 0.972 | -3.057 | 7.617 |
| -2.896548426609922 | 0.97 | -3.053 | 7.605 |
| -2.890265241302742 | 0.969 | -3.048 | 7.592 |
| -2.883982055995562 | 0.967 | -3.044 | 7.578 |
| -2.877698870688383 | 0.965 | -3.039 | 7.565 |
| -2.871415685381203 | 0.964 | -3.034 | 7.551 |
| -2.865132500074023 | 0.962 | -3.029 | 7.537 |
| -2.858849314766844 | 0.96 | -3.024 | 7.523 |
| -2.852566129459664 | 0.959 | -3.019 | 7.509 |
| -2.846282944152485 | 0.957 | -3.014 | 7.494 |
| -2.839999758845305 | 0.955 | -3.009 | 7.479 |
| -2.833716573538125 | 0.953 | -3.004 | 7.464 |
| -2.827433388230946 | 0.951 | -2.998 | 7.448 |
| -2.821150202923766 | 0.949 | -2.993 | 7.433 |
| -2.814867017616586 | 0.947 | -2.987 | 7.417 |
| -2.808583832309407 | 0.945 | -2.981 | 7.401 |
| -2.802300647002227 | 0.943 | -2.975 | 7.385 |
| -2.796017461695047 | 0.941 | -2.969 | 7.368 |
| -2.789734276387867 | 0.939 | -2.963 | 7.351 |
| -2.783451091080688 | 0.937 | -2.957 | 7.334 |
| -2.777167905773509 | 0.934 | -2.951 | 7.317 |
| -2.770884720466329 | 0.932 | -2.945 | 7.3 |
| -2.764601535159149 | 0.93 | -2.939 | 7.282 |
| -2.75831834985197 | 0.927 | -2.932 | 7.264 |
| -2.75203516454479 | 0.925 | -2.926 | 7.246 |
| -2.74575197923761 | 0.923 | -2.919 | 7.228 |
| -2.739468793930431 | 0.92 | -2.912 | 7.21 |
| -2.733185608623251 | 0.918 | -2.906 | 7.191 |
| -2.726902423316071 | 0.915 | -2.899 | 7.173 |
| -2.720619238008892 | 0.913 | -2.892 | 7.154 |
| -2.714336052701712 | 0.91 | -2.885 | 7.135 |
| -2.708052867394532 | 0.907 | -2.878 | 7.115 |
| -2.701769682087352 | 0.905 | -2.87 | 7.096 |
| -2.695486496780173 | 0.902 | -2.863 | 7.076 |
| -2.689203311472993 | 0.899 | -2.856 | 7.057 |
| -2.682920126165814 | 0.897 | -2.848 | 7.037 |
| -2.676636940858634 | 0.894 | -2.841 | 7.016 |
| -2.670353755551454 | 0.891 | -2.833 | 6.996 |
| -2.664070570244275 | 0.888 | -2.826 | 6.976 |
| -2.657787384937095 | 0.885 | -2.818 | 6.955 |
| -2.651504199629916 | 0.882 | -2.81 | 6.934 |
| -2.645221014322736 | 0.879 | -2.802 | 6.914 |
| -2.638937829015556 | 0.876 | -2.794 | 6.893 |
| -2.632654643708377 | 0.873 | -2.786 | 6.871 |
| -2.626371458401197 | 0.87 | -2.778 | 6.85 |
| -2.620088273094018 | 0.867 | -2.77 | 6.829 |
| -2.613805087786838 | 0.864 | -2.762 | 6.807 |
| -2.607521902479658 | 0.861 | -2.753 | 6.786 |
| -2.601238717172478 | 0.858 | -2.745 | 6.764 |
| -2.594955531865299 | 0.854 | -2.737 | 6.742 |
| -2.588672346558119 | 0.851 | -2.728 | 6.72 |
| -2.58238916125094 | 0.848 | -2.72 | 6.698 |
| -2.57610597594376 | 0.844 | -2.711 | 6.675 |
| -2.56982279063658 | 0.841 | -2.702 | 6.653 |
| -2.563539605329401 | 0.838 | -2.693 | 6.63 |
| -2.557256420022221 | 0.834 | -2.685 | 6.608 |
| -2.550973234715042 | 0.831 | -2.676 | 6.585 |
| -2.544690049407862 | 0.827 | -2.667 | 6.562 |
| -2.538406864100682 | 0.824 | -2.658 | 6.539 |
| -2.532123678793503 | 0.82 | -2.649 | 6.516 |
| -2.525840493486323 | 0.816 | -2.64 | 6.493 |
| -2.519557308179143 | 0.813 | -2.63 | 6.47 |
| -2.513274122871964 | 0.809 | -2.621 | 6.447 |
| -2.506990937564784 | 0.805 | -2.612 | 6.423 |
| -2.500707752257604 | 0.802 | -2.602 | 6.4 |
| -2.494424566950425 | 0.798 | -2.593 | 6.376 |
| -2.488141381643245 | 0.794 | -2.583 | 6.353 |
| -2.481858196336065 | 0.79 | -2.574 | 6.329 |
| -2.475575011028886 | 0.786 | -2.564 | 6.305 |
| -2.469291825721706 | 0.782 | -2.555 | 6.281 |
| -2.463008640414527 | 0.778 | -2.545 | 6.258 |
| -2.456725455107347 | 0.775 | -2.535 | 6.234 |
| -2.450442269800167 | 0.771 | -2.526 | 6.21 |
| -2.444159084492988 | 0.766 | -2.516 | 6.186 |
| -2.437875899185808 | 0.762 | -2.506 | 6.161 |
| -2.431592713878628 | 0.758 | -2.496 | 6.137 |
| -2.425309528571449 | 0.754 | -2.486 | 6.113 |
| -2.419026343264269 | 0.75 | -2.476 | 6.089 |
| -2.412743157957089 | 0.746 | -2.466 | 6.064 |
| -2.40645997264991 | 0.742 | -2.456 | 6.04 |
| -2.40017678734273 | 0.738 | -2.445 | 6.016 |
| -2.393893602035551 | 0.733 | -2.435 | 5.991 |
| -2.387610416728371 | 0.729 | -2.425 | 5.967 |
| -2.381327231421191 | 0.725 | -2.415 | 5.942 |
| -2.375044046114012 | 0.72 | -2.404 | 5.917 |
| -2.368760860806832 | 0.716 | -2.394 | 5.893 |
| -2.362477675499652 | 0.712 | -2.384 | 5.868 |
| -2.356194490192473 | 0.707 | -2.373 | 5.844 |
| -2.349911304885293 | 0.703 | -2.363 | 5.819 |
| -2.343628119578113 | 0.698 | -2.352 | 5.794 |
| -2.337344934270934 | 0.694 | -2.342 | 5.769 |
| -2.331061748963754 | 0.689 | -2.331 | 5.745 |
| -2.324778563656574 | 0.685 | -2.32 | 5.72 |
| -2.318495378349395 | 0.68 | -2.31 | 5.695 |
| -2.312212193042215 | 0.675 | -2.299 | 5.67 |
| -2.305929007735036 | 0.671 | -2.288 | 5.646 |
| -2.299645822427856 | 0.666 | -2.278 | 5.621 |
| -2.293362637120676 | 0.661 | -2.267 | 5.596 |
| -2.287079451813496 | 0.657 | -2.256 | 5.571 |
| -2.280796266506317 | 0.652 | -2.245 | 5.547 |
| -2.274513081199137 | 0.647 | -2.234 | 5.522 |
| -2.268229895891957 | 0.642 | -2.223 | 5.497 |
| -2.261946710584778 | 0.637 | -2.212 | 5.472 |
| -2.255663525277598 | 0.633 | -2.201 | 5.447 |
| -2.249380339970419 | 0.628 | -2.19 | 5.423 |
| -2.24309715466324 | 0.623 | -2.179 | 5.398 |
| -2.23681396935606 | 0.618 | -2.168 | 5.373 |
| -2.23053078404888 | 0.613 | -2.157 | 5.348 |
| -2.2242475987417 | 0.608 | -2.146 | 5.324 |
| -2.217964413434521 | 0.603 | -2.135 | 5.299 |
| -2.211681228127341 | 0.598 | -2.124 | 5.274 |
| -2.205398042820161 | 0.593 | -2.113 | 5.25 |
| -2.199114857512981 | 0.588 | -2.102 | 5.225 |
| -2.192831672205802 | 0.583 | -2.09 | 5.201 |
| -2.186548486898622 | 0.578 | -2.079 | 5.176 |
| -2.180265301591443 | 0.572 | -2.068 | 5.152 |
| -2.173982116284263 | 0.567 | -2.057 | 5.127 |
| -2.167698930977084 | 0.562 | -2.046 | 5.103 |
| -2.161415745669904 | 0.557 | -2.034 | 5.078 |
| -2.155132560362724 | 0.552 | -2.023 | 5.054 |
| -2.148849375055545 | 0.546 | -2.012 | 5.03 |
| -2.142566189748365 | 0.541 | -2 | 5.005 |
| -2.136283004441185 | 0.536 | -1.989 | 4.981 |
| -2.129999819134006 | 0.531 | -1.978 | 4.957 |
| -2.123716633826826 | 0.525 | -1.966 | 4.933 |
| -2.117433448519646 | 0.52 | -1.955 | 4.909 |
| -2.111150263212467 | 0.514 | -1.944 | 4.885 |
| -2.104867077905287 | 0.509 | -1.932 | 4.861 |
| -2.098583892598107 | 0.504 | -1.921 | 4.837 |
| -2.092300707290928 | 0.498 | -1.909 | 4.813 |
| -2.086017521983748 | 0.493 | -1.898 | 4.789 |
| -2.079734336676569 | 0.487 | -1.887 | 4.765 |
| -2.073451151369389 | 0.482 | -1.875 | 4.742 |
| -2.06716796606221 | 0.476 | -1.864 | 4.718 |
| -2.06088478075503 | 0.471 | -1.852 | 4.694 |
| -2.05460159544785 | 0.465 | -1.841 | 4.671 |
| -2.04831841014067 | 0.46 | -1.83 | 4.647 |
| -2.042035224833491 | 0.454 | -1.818 | 4.624 |
| -2.035752039526311 | 0.448 | -1.807 | 4.601 |
| -2.029468854219131 | 0.443 | -1.795 | 4.578 |
| -2.023185668911951 | 0.437 | -1.784 | 4.554 |
| -2.016902483604772 | 0.431 | -1.772 | 4.531 |
| -2.010619298297592 | 0.426 | -1.761 | 4.508 |
| -2.004336112990412 | 0.42 | -1.749 | 4.485 |
| -1.998052927683233 | 0.414 | -1.738 | 4.462 |
| -1.991769742376054 | 0.409 | -1.727 | 4.44 |
| -1.985486557068874 | 0.403 | -1.715 | 4.417 |
| -1.979203371761694 | 0.397 | -1.704 | 4.394 |
| -1.972920186454515 | 0.391 | -1.692 | 4.372 |
| -1.966637001147335 | 0.386 | -1.681 | 4.349 |
| -1.960353815840155 | 0.38 | -1.67 | 4.327 |
| -1.954070630532976 | 0.374 | -1.658 | 4.305 |
| -1.947787445225796 | 0.368 | -1.647 | 4.282 |
| -1.941504259918616 | 0.362 | -1.635 | 4.26 |
| -1.935221074611437 | 0.356 | -1.624 | 4.238 |
| -1.928937889304257 | 0.351 | -1.613 | 4.216 |
| -1.922654703997078 | 0.345 | -1.601 | 4.194 |
| -1.916371518689898 | 0.339 | -1.59 | 4.173 |
| -1.910088333382718 | 0.333 | -1.579 | 4.151 |
| -1.903805148075539 | 0.327 | -1.567 | 4.129 |
| -1.897521962768359 | 0.321 | -1.556 | 4.108 |
| -1.891238777461179 | 0.315 | -1.545 | 4.087 |
| -1.884955592154 | 0.309 | -1.534 | 4.065 |
| -1.87867240684682 | 0.303 | -1.522 | 4.044 |
| -1.87238922153964 | 0.297 | -1.511 | 4.023 |
| -1.866106036232461 | 0.291 | -1.5 | 4.002 |
| -1.859822850925281 | 0.285 | -1.489 | 3.981 |
| -1.853539665618102 | 0.279 | -1.477 | 3.96 |
| -1.847256480310922 | 0.273 | -1.466 | 3.94 |
| -1.840973295003742 | 0.267 | -1.455 | 3.919 |
| -1.834690109696563 | 0.261 | -1.444 | 3.899 |
| -1.828406924389383 | 0.255 | -1.433 | 3.878 |
| -1.822123739082203 | 0.249 | -1.422 | 3.858 |
| -1.815840553775024 | 0.243 | -1.411 | 3.838 |
| -1.809557368467844 | 0.236 | -1.4 | 3.818 |
| -1.803274183160664 | 0.23 | -1.389 | 3.798 |
| -1.796990997853485 | 0.224 | -1.378 | 3.778 |
| -1.790707812546305 | 0.218 | -1.367 | 3.758 |
| -1.784424627239125 | 0.212 | -1.356 | 3.739 |
| -1.778141441931946 | 0.206 | -1.345 | 3.719 |
| -1.771858256624766 | 0.2 | -1.334 | 3.7 |
| -1.765575071317587 | 0.194 | -1.323 | 3.681 |
| -1.759291886010407 | 0.187 | -1.312 | 3.661 |
| -1.753008700703227 | 0.181 | -1.301 | 3.642 |
| -1.746725515396048 | 0.175 | -1.29 | 3.623 |
| -1.740442330088868 | 0.169 | -1.279 | 3.605 |
| -1.734159144781688 | 0.163 | -1.269 | 3.586 |
| -1.727875959474509 | 0.156 | -1.258 | 3.567 |
| -1.72159277416733 | 0.15 | -1.247 | 3.549 |
| -1.715309588860149 | 0.144 | -1.237 | 3.531 |
| -1.70902640355297 | 0.138 | -1.226 | 3.512 |
| -1.70274321824579 | 0.132 | -1.215 | 3.494 |
| -1.69646003293861 | 0.125 | -1.205 | 3.476 |
| -1.690176847631431 | 0.119 | -1.194 | 3.458 |
| -1.683893662324251 | 0.113 | -1.184 | 3.441 |
| -1.677610477017072 | 0.107 | -1.173 | 3.423 |
| -1.671327291709892 | 0.1 | -1.163 | 3.405 |
| -1.665044106402712 | 0.094 | -1.152 | 3.388 |
| -1.658760921095533 | 0.088 | -1.142 | 3.371 |
| -1.652477735788353 | 0.082 | -1.131 | 3.354 |
| -1.646194550481173 | 0.075 | -1.121 | 3.337 |
| -1.639911365173994 | 0.069 | -1.111 | 3.32 |
| -1.633628179866814 | 0.063 | -1.101 | 3.303 |
| -1.627344994559634 | 0.057 | -1.09 | 3.286 |
| -1.621061809252455 | 0.05 | -1.08 | 3.27 |
| -1.614778623945275 | 0.044 | -1.07 | 3.253 |
| -1.608495438638096 | 0.038 | -1.06 | 3.237 |
| -1.602212253330916 | 0.031 | -1.05 | 3.221 |
| -1.595929068023736 | 0.025 | -1.04 | 3.205 |
| -1.589645882716557 | 0.019 | -1.03 | 3.189 |
| -1.583362697409377 | 0.013 | -1.02 | 3.173 |
| -1.577079512102197 | 0.006 | -1.01 | 3.157 |
| -1.570796326795018 | 0 | -1 | 3.142 |
| -1.564513141487838 | -0.006 | -0.99 | 3.126 |
| -1.558229956180659 | -0.013 | -0.98 | 3.111 |
| -1.551946770873479 | -0.019 | -0.971 | 3.096 |
| -1.545663585566299 | -0.025 | -0.961 | 3.081 |
| -1.53938040025912 | -0.031 | -0.951 | 3.066 |
| -1.53309721495194 | -0.038 | -0.942 | 3.051 |
| -1.52681402964476 | -0.044 | -0.932 | 3.036 |
| -1.520530844337581 | -0.05 | -0.922 | 3.022 |
| -1.514247659030401 | -0.057 | -0.913 | 3.007 |
| -1.507964473723221 | -0.063 | -0.903 | 2.993 |
| -1.501681288416042 | -0.069 | -0.894 | 2.979 |
| -1.495398103108862 | -0.075 | -0.885 | 2.965 |
| -1.489114917801682 | -0.082 | -0.875 | 2.951 |
| -1.482831732494503 | -0.088 | -0.866 | 2.937 |
| -1.476548547187323 | -0.094 | -0.857 | 2.923 |
| -1.470265361880144 | -0.1 | -0.847 | 2.909 |
| -1.463982176572964 | -0.107 | -0.838 | 2.896 |
| -1.457698991265784 | -0.113 | -0.829 | 2.883 |
| -1.451415805958605 | -0.119 | -0.82 | 2.869 |
| -1.445132620651425 | -0.125 | -0.811 | 2.856 |
| -1.438849435344245 | -0.132 | -0.802 | 2.843 |
| -1.432566250037066 | -0.138 | -0.793 | 2.831 |
| -1.426283064729886 | -0.144 | -0.784 | 2.818 |
| -1.419999879422706 | -0.15 | -0.775 | 2.805 |
| -1.413716694115527 | -0.156 | -0.767 | 2.793 |
| -1.407433508808347 | -0.163 | -0.758 | 2.781 |
| -1.401150323501168 | -0.169 | -0.749 | 2.768 |
| -1.394867138193988 | -0.175 | -0.74 | 2.756 |
| -1.388583952886808 | -0.181 | -0.732 | 2.744 |
| -1.382300767579629 | -0.187 | -0.723 | 2.732 |
| -1.376017582272449 | -0.194 | -0.715 | 2.721 |
| -1.369734396965269 | -0.2 | -0.706 | 2.709 |
| -1.36345121165809 | -0.206 | -0.698 | 2.698 |
| -1.35716802635091 | -0.212 | -0.69 | 2.686 |
| -1.35088484104373 | -0.218 | -0.681 | 2.675 |
| -1.344601655736551 | -0.224 | -0.673 | 2.664 |
| -1.338318470429371 | -0.23 | -0.665 | 2.653 |
| -1.332035285122191 | -0.236 | -0.657 | 2.642 |
| -1.325752099815012 | -0.243 | -0.649 | 2.631 |
| -1.319468914507832 | -0.249 | -0.64 | 2.62 |
| -1.313185729200653 | -0.255 | -0.632 | 2.61 |
| -1.306902543893473 | -0.261 | -0.624 | 2.599 |
| -1.300619358586293 | -0.267 | -0.617 | 2.589 |
| -1.294336173279114 | -0.273 | -0.609 | 2.579 |
| -1.288052987971934 | -0.279 | -0.601 | 2.569 |
| -1.281769802664754 | -0.285 | -0.593 | 2.559 |
| -1.275486617357575 | -0.291 | -0.585 | 2.549 |
| -1.269203432050395 | -0.297 | -0.578 | 2.539 |
| -1.262920246743215 | -0.303 | -0.57 | 2.53 |
| -1.256637061436036 | -0.309 | -0.563 | 2.52 |
| -1.250353876128856 | -0.315 | -0.555 | 2.511 |
| -1.244070690821677 | -0.321 | -0.548 | 2.502 |
| -1.237787505514497 | -0.327 | -0.54 | 2.493 |
| -1.231504320207317 | -0.333 | -0.533 | 2.483 |
| -1.225221134900138 | -0.339 | -0.526 | 2.475 |
| -1.218937949592958 | -0.345 | -0.519 | 2.466 |
| -1.212654764285778 | -0.351 | -0.511 | 2.457 |
| -1.206371578978599 | -0.356 | -0.504 | 2.448 |
| -1.20008839367142 | -0.362 | -0.497 | 2.44 |
| -1.193805208364239 | -0.368 | -0.49 | 2.432 |
| -1.18752202305706 | -0.374 | -0.483 | 2.423 |
| -1.18123883774988 | -0.38 | -0.476 | 2.415 |
| -1.1749556524427 | -0.386 | -0.47 | 2.407 |
| -1.168672467135521 | -0.391 | -0.463 | 2.399 |
| -1.162389281828341 | -0.397 | -0.456 | 2.391 |
| -1.156106096521162 | -0.403 | -0.449 | 2.384 |
| -1.149822911213982 | -0.409 | -0.443 | 2.376 |
| -1.143539725906802 | -0.414 | -0.436 | 2.368 |
| -1.137256540599623 | -0.42 | -0.43 | 2.361 |
| -1.130973355292443 | -0.426 | -0.423 | 2.354 |
| -1.124690169985263 | -0.431 | -0.417 | 2.346 |
| -1.118406984678084 | -0.437 | -0.411 | 2.339 |
| -1.112123799370904 | -0.443 | -0.404 | 2.332 |
| -1.105840614063724 | -0.448 | -0.398 | 2.325 |
| -1.099557428756545 | -0.454 | -0.392 | 2.319 |
| -1.093274243449365 | -0.46 | -0.386 | 2.312 |
| -1.086991058142186 | -0.465 | -0.38 | 2.305 |
| -1.080707872835006 | -0.471 | -0.374 | 2.299 |
| -1.074424687527826 | -0.476 | -0.368 | 2.292 |
| -1.068141502220647 | -0.482 | -0.362 | 2.286 |
| -1.061858316913467 | -0.487 | -0.356 | 2.28 |
| -1.055575131606287 | -0.493 | -0.35 | 2.274 |
| -1.049291946299108 | -0.498 | -0.344 | 2.267 |
| -1.043008760991928 | -0.504 | -0.339 | 2.262 |
| -1.036725575684748 | -0.509 | -0.333 | 2.256 |
| -1.030442390377569 | -0.514 | -0.327 | 2.25 |
| -1.024159205070389 | -0.52 | -0.322 | 2.244 |
| -1.01787601976321 | -0.525 | -0.316 | 2.239 |
| -1.01159283445603 | -0.531 | -0.311 | 2.233 |
| -1.00530964914885 | -0.536 | -0.306 | 2.228 |
| -0.999026463841671 | -0.541 | -0.3 | 2.222 |
| -0.992743278534491 | -0.546 | -0.295 | 2.217 |
| -0.986460093227311 | -0.552 | -0.29 | 2.212 |
| -0.980176907920132 | -0.557 | -0.285 | 2.207 |
| -0.973893722612952 | -0.562 | -0.28 | 2.202 |
| -0.967610537305772 | -0.567 | -0.275 | 2.197 |
| -0.961327351998593 | -0.572 | -0.27 | 2.192 |
| -0.955044166691413 | -0.578 | -0.265 | 2.188 |
| -0.948760981384233 | -0.583 | -0.26 | 2.183 |
| -0.942477796077054 | -0.588 | -0.255 | 2.178 |
| -0.936194610769874 | -0.593 | -0.25 | 2.174 |
| -0.929911425462695 | -0.598 | -0.246 | 2.17 |
| -0.923628240155515 | -0.603 | -0.241 | 2.165 |
| -0.917345054848335 | -0.608 | -0.236 | 2.161 |
| -0.911061869541156 | -0.613 | -0.232 | 2.157 |
| -0.904778684233976 | -0.618 | -0.227 | 2.153 |
| -0.898495498926796 | -0.623 | -0.223 | 2.149 |
| -0.892212313619617 | -0.628 | -0.218 | 2.145 |
| -0.885929128312437 | -0.633 | -0.214 | 2.141 |
| -0.879645943005257 | -0.637 | -0.21 | 2.137 |
| -0.873362757698078 | -0.642 | -0.206 | 2.133 |
| -0.867079572390898 | -0.647 | -0.201 | 2.13 |
| -0.860796387083718 | -0.652 | -0.197 | 2.126 |
| -0.854513201776539 | -0.657 | -0.193 | 2.123 |
| -0.848230016469359 | -0.661 | -0.189 | 2.119 |
| -0.84194683116218 | -0.666 | -0.185 | 2.116 |
| -0.835663645855 | -0.671 | -0.181 | 2.113 |
| -0.82938046054782 | -0.675 | -0.177 | 2.109 |
| -0.823097275240641 | -0.68 | -0.174 | 2.106 |
| -0.816814089933461 | -0.685 | -0.17 | 2.103 |
| -0.810530904626281 | -0.689 | -0.166 | 2.1 |
| -0.804247719319102 | -0.694 | -0.162 | 2.097 |
| -0.797964534011922 | -0.698 | -0.159 | 2.094 |
| -0.791681348704742 | -0.703 | -0.155 | 2.092 |
| -0.785398163397563 | -0.707 | -0.152 | 2.089 |
| -0.779114978090383 | -0.712 | -0.148 | 2.086 |
| -0.772831792783204 | -0.716 | -0.145 | 2.083 |
| -0.766548607476024 | -0.72 | -0.142 | 2.081 |
| -0.760265422168844 | -0.725 | -0.138 | 2.078 |
| -0.753982236861665 | -0.729 | -0.135 | 2.076 |
| -0.747699051554485 | -0.733 | -0.132 | 2.073 |
| -0.741415866247305 | -0.738 | -0.129 | 2.071 |
| -0.735132680940126 | -0.742 | -0.125 | 2.069 |
| -0.728849495632946 | -0.746 | -0.122 | 2.066 |
| -0.722566310325766 | -0.75 | -0.119 | 2.064 |
| -0.716283125018587 | -0.754 | -0.116 | 2.062 |
| -0.709999939711407 | -0.758 | -0.113 | 2.06 |
| -0.703716754404227 | -0.762 | -0.111 | 2.058 |
| -0.697433569097048 | -0.766 | -0.108 | 2.056 |
| -0.691150383789868 | -0.771 | -0.105 | 2.054 |
| -0.684867198482689 | -0.775 | -0.102 | 2.052 |
| -0.678584013175509 | -0.778 | -0.099 | 2.05 |
| -0.672300827868329 | -0.782 | -0.097 | 2.049 |
| -0.66601764256115 | -0.786 | -0.094 | 2.047 |
| -0.65973445725397 | -0.79 | -0.092 | 2.045 |
| -0.65345127194679 | -0.794 | -0.089 | 2.043 |
| -0.647168086639611 | -0.798 | -0.087 | 2.042 |
| -0.640884901332431 | -0.802 | -0.084 | 2.04 |
| -0.634601716025251 | -0.805 | -0.082 | 2.039 |
| -0.628318530718072 | -0.809 | -0.079 | 2.037 |
| -0.622035345410892 | -0.813 | -0.077 | 2.036 |
| -0.615752160103712 | -0.816 | -0.075 | 2.034 |
| -0.609468974796533 | -0.82 | -0.073 | 2.033 |
| -0.603185789489353 | -0.824 | -0.071 | 2.032 |
| -0.596902604182174 | -0.827 | -0.068 | 2.03 |
| -0.590619418874994 | -0.831 | -0.066 | 2.029 |
| -0.584336233567814 | -0.834 | -0.064 | 2.028 |
| -0.578053048260635 | -0.838 | -0.062 | 2.027 |
| -0.571769862953455 | -0.841 | -0.06 | 2.026 |
| -0.565486677646275 | -0.844 | -0.058 | 2.025 |
| -0.559203492339096 | -0.848 | -0.056 | 2.024 |
| -0.552920307031916 | -0.851 | -0.055 | 2.023 |
| -0.546637121724737 | -0.854 | -0.053 | 2.022 |
| -0.540353936417557 | -0.858 | -0.051 | 2.021 |
| -0.534070751110377 | -0.861 | -0.049 | 2.02 |
| -0.527787565803198 | -0.864 | -0.048 | 2.019 |
| -0.521504380496018 | -0.867 | -0.046 | 2.018 |
| -0.515221195188838 | -0.87 | -0.044 | 2.017 |
| -0.508938009881659 | -0.873 | -0.043 | 2.016 |
| -0.502654824574479 | -0.876 | -0.041 | 2.016 |
| -0.496371639267299 | -0.879 | -0.04 | 2.015 |
| -0.49008845396012 | -0.882 | -0.038 | 2.014 |
| -0.48380526865294 | -0.885 | -0.037 | 2.013 |
| -0.477522083345761 | -0.888 | -0.035 | 2.013 |
| -0.471238898038581 | -0.891 | -0.034 | 2.012 |
| -0.464955712731402 | -0.894 | -0.033 | 2.011 |
| -0.458672527424222 | -0.897 | -0.031 | 2.011 |
| -0.452389342117042 | -0.899 | -0.03 | 2.01 |
| -0.446106156809863 | -0.902 | -0.029 | 2.01 |
| -0.439822971502683 | -0.905 | -0.028 | 2.009 |
| -0.433539786195504 | -0.907 | -0.027 | 2.009 |
| -0.427256600888324 | -0.91 | -0.026 | 2.008 |
| -0.420973415581144 | -0.913 | -0.024 | 2.008 |
| -0.414690230273965 | -0.915 | -0.023 | 2.007 |
| -0.408407044966785 | -0.918 | -0.022 | 2.007 |
| -0.402123859659606 | -0.92 | -0.021 | 2.006 |
| -0.395840674352426 | -0.923 | -0.02 | 2.006 |
| -0.389557489045247 | -0.925 | -0.019 | 2.006 |
| -0.383274303738067 | -0.927 | -0.018 | 2.005 |
| -0.376991118430887 | -0.93 | -0.018 | 2.005 |
| -0.370707933123708 | -0.932 | -0.017 | 2.005 |
| -0.364424747816528 | -0.934 | -0.016 | 2.004 |
| -0.358141562509349 | -0.937 | -0.015 | 2.004 |
| -0.351858377202169 | -0.939 | -0.014 | 2.004 |
| -0.345575191894989 | -0.941 | -0.014 | 2.004 |
| -0.33929200658781 | -0.943 | -0.013 | 2.003 |
| -0.33300882128063 | -0.945 | -0.012 | 2.003 |
| -0.326725635973451 | -0.947 | -0.012 | 2.003 |
| -0.320442450666271 | -0.949 | -0.011 | 2.003 |
| -0.314159265359092 | -0.951 | -0.01 | 2.002 |
| -0.307876080051912 | -0.953 | -0.01 | 2.002 |
| -0.301592894744732 | -0.955 | -0.009 | 2.002 |
| -0.295309709437553 | -0.957 | -0.009 | 2.002 |
| -0.289026524130373 | -0.959 | -0.008 | 2.002 |
| -0.282743338823194 | -0.96 | -0.007 | 2.002 |
| -0.276460153516014 | -0.962 | -0.007 | 2.001 |
| -0.270176968208834 | -0.964 | -0.007 | 2.001 |
| -0.263893782901655 | -0.965 | -0.006 | 2.001 |
| -0.257610597594475 | -0.967 | -0.006 | 2.001 |
| -0.251327412287296 | -0.969 | -0.005 | 2.001 |
| -0.245044226980116 | -0.97 | -0.005 | 2.001 |
| -0.238761041672937 | -0.972 | -0.005 | 2.001 |
| -0.232477856365757 | -0.973 | -0.004 | 2.001 |
| -0.226194671058577 | -0.975 | -0.004 | 2.001 |
| -0.219911485751398 | -0.976 | -0.004 | 2.001 |
| -0.213628300444218 | -0.977 | -0.003 | 2.001 |
| -0.207345115137039 | -0.979 | -0.003 | 2 |
| -0.201061929829859 | -0.98 | -0.003 | 2 |
| -0.194778744522679 | -0.981 | -0.002 | 2 |
| -0.1884955592155 | -0.982 | -0.002 | 2 |
| -0.18221237390832 | -0.983 | -0.002 | 2 |
| -0.175929188601141 | -0.985 | -0.002 | 2 |
| -0.169646003293961 | -0.986 | -0.002 | 2 |
| -0.163362817986782 | -0.987 | -0.001 | 2 |
| -0.157079632679602 | -0.988 | -0.001 | 2 |
| -0.150796447372422 | -0.989 | -0.001 | 2 |
| -0.144513262065243 | -0.99 | -0.001 | 2 |
| -0.138230076758063 | -0.99 | -0.001 | 2 |
| -0.131946891450884 | -0.991 | -0.001 | 2 |
| -0.125663706143704 | -0.992 | -0.001 | 2 |
| -0.119380520836524 | -0.993 | -0.001 | 2 |
| -0.113097335529345 | -0.994 | 0 | 2 |
| -0.106814150222165 | -0.994 | 0 | 2 |
| -0.100530964914986 | -0.995 | 0 | 2 |
| -0.0942477796078061 | -0.996 | 0 | 2 |
| -0.0879645943006265 | -0.996 | 0 | 2 |
| -0.0816814089934469 | -0.997 | 0 | 2 |
| -0.0753982236862674 | -0.997 | 0 | 2 |
| -0.0691150383790878 | -0.998 | 0 | 2 |
| -0.0628318530719082 | -0.998 | 0 | 2 |
| -0.0565486677647286 | -0.998 | 0 | 2 |
| -0.050265482457549 | -0.999 | 0 | 2 |
| -0.0439822971503694 | -0.999 | 0 | 2 |
| -0.0376991118431899 | -0.999 | 0 | 2 |
| -0.0314159265360103 | -1 | 0 | 2 |
| -0.0251327412288307 | -1 | 0 | 2 |
| -0.0188495559216511 | -1 | 0 | 2 |
| -0.0125663706144715 | -1 | 0 | 2 |
| -0.00628318530729192 | -1 | 0 | 2 |
| -1.12338957580782e-13 | -1 | 0 | 2 |
| 0.00628318530706725 | -1 | 0 | 2 |
| 0.0125663706142468 | -1 | 0 | 2 |
| 0.0188495559214264 | -1 | 0 | 2 |
| 0.025132741228606 | -1 | 0 | 2 |
| 0.0314159265357856 | -1 | 0 | 2 |
| 0.0376991118429652 | -0.999 | 0 | 2 |
| 0.0439822971501448 | -0.999 | 0 | 2 |
| 0.0502654824573243 | -0.999 | 0 | 2 |
| 0.0565486677645039 | -0.998 | 0 | 2 |
| 0.0628318530716835 | -0.998 | 0 | 2 |
| 0.0691150383788631 | -0.998 | 0 | 2 |
| 0.0753982236860427 | -0.997 | 0 | 2 |
| 0.0816814089932222 | -0.997 | 0 | 2 |
| 0.0879645943004018 | -0.996 | 0 | 2 |
| 0.0942477796075814 | -0.996 | 0 | 2 |
| 0.100530964914761 | -0.995 | 0 | 2 |
| 0.106814150221941 | -0.994 | 0 | 2 |
| 0.11309733552912 | -0.994 | 0 | 2 |
| 0.1193805208363 | -0.993 | 0.001 | 2 |
| 0.125663706143479 | -0.992 | 0.001 | 2 |
| 0.131946891450659 | -0.991 | 0.001 | 2 |
| 0.138230076757839 | -0.99 | 0.001 | 2 |
| 0.144513262065018 | -0.99 | 0.001 | 2 |
| 0.150796447372198 | -0.989 | 0.001 | 2 |
| 0.157079632679377 | -0.988 | 0.001 | 2 |
| 0.163362817986557 | -0.987 | 0.001 | 2 |
| 0.169646003293736 | -0.986 | 0.002 | 2 |
| 0.175929188600916 | -0.985 | 0.002 | 2 |
| 0.182212373908096 | -0.983 | 0.002 | 2 |
| 0.188495559215275 | -0.982 | 0.002 | 2 |
| 0.194778744522455 | -0.981 | 0.002 | 2 |
| 0.201061929829634 | -0.98 | 0.003 | 2 |
| 0.207345115136814 | -0.979 | 0.003 | 2 |
| 0.213628300443994 | -0.977 | 0.003 | 2.001 |
| 0.219911485751173 | -0.976 | 0.004 | 2.001 |
| 0.226194671058353 | -0.975 | 0.004 | 2.001 |
| 0.232477856365532 | -0.973 | 0.004 | 2.001 |
| 0.238761041672712 | -0.972 | 0.005 | 2.001 |
| 0.245044226979891 | -0.97 | 0.005 | 2.001 |
| 0.251327412287071 | -0.969 | 0.005 | 2.001 |
| 0.257610597594251 | -0.967 | 0.006 | 2.001 |
| 0.26389378290143 | -0.965 | 0.006 | 2.001 |
| 0.27017696820861 | -0.964 | 0.007 | 2.001 |
| 0.276460153515789 | -0.962 | 0.007 | 2.001 |
| 0.282743338822969 | -0.96 | 0.007 | 2.002 |
| 0.289026524130149 | -0.959 | 0.008 | 2.002 |
| 0.295309709437328 | -0.957 | 0.009 | 2.002 |
| 0.301592894744508 | -0.955 | 0.009 | 2.002 |
| 0.307876080051687 | -0.953 | 0.01 | 2.002 |
| 0.314159265358867 | -0.951 | 0.01 | 2.002 |
| 0.320442450666046 | -0.949 | 0.011 | 2.003 |
| 0.326725635973226 | -0.947 | 0.012 | 2.003 |
| 0.333008821280406 | -0.945 | 0.012 | 2.003 |
| 0.339292006587585 | -0.943 | 0.013 | 2.003 |
| 0.345575191894765 | -0.941 | 0.014 | 2.004 |
| 0.351858377201944 | -0.939 | 0.014 | 2.004 |
| 0.358141562509124 | -0.937 | 0.015 | 2.004 |
| 0.364424747816304 | -0.934 | 0.016 | 2.004 |
| 0.370707933123483 | -0.932 | 0.017 | 2.005 |
| 0.376991118430663 | -0.93 | 0.018 | 2.005 |
| 0.383274303737842 | -0.927 | 0.018 | 2.005 |
| 0.389557489045022 | -0.925 | 0.019 | 2.006 |
| 0.395840674352201 | -0.923 | 0.02 | 2.006 |
| 0.402123859659381 | -0.92 | 0.021 | 2.006 |
| 0.408407044966561 | -0.918 | 0.022 | 2.007 |
| 0.41469023027374 | -0.915 | 0.023 | 2.007 |
| 0.42097341558092 | -0.913 | 0.024 | 2.008 |
| 0.427256600888099 | -0.91 | 0.026 | 2.008 |
| 0.433539786195279 | -0.907 | 0.027 | 2.009 |
| 0.439822971502459 | -0.905 | 0.028 | 2.009 |
| 0.446106156809638 | -0.902 | 0.029 | 2.01 |
| 0.452389342116818 | -0.899 | 0.03 | 2.01 |
| 0.458672527423997 | -0.897 | 0.031 | 2.011 |
| 0.464955712731177 | -0.894 | 0.033 | 2.011 |
| 0.471238898038356 | -0.891 | 0.034 | 2.012 |
| 0.477522083345536 | -0.888 | 0.035 | 2.013 |
| 0.483805268652716 | -0.885 | 0.037 | 2.013 |
| 0.490088453959895 | -0.882 | 0.038 | 2.014 |
| 0.496371639267075 | -0.879 | 0.04 | 2.015 |
| 0.502654824574254 | -0.876 | 0.041 | 2.016 |
| 0.508938009881434 | -0.873 | 0.043 | 2.016 |
| 0.515221195188614 | -0.87 | 0.044 | 2.017 |
| 0.521504380495793 | -0.867 | 0.046 | 2.018 |
| 0.527787565802973 | -0.864 | 0.048 | 2.019 |
| 0.534070751110153 | -0.861 | 0.049 | 2.02 |
| 0.540353936417332 | -0.858 | 0.051 | 2.021 |
| 0.546637121724512 | -0.854 | 0.053 | 2.022 |
| 0.552920307031692 | -0.851 | 0.055 | 2.023 |
| 0.559203492338871 | -0.848 | 0.056 | 2.024 |
| 0.565486677646051 | -0.844 | 0.058 | 2.025 |
| 0.571769862953231 | -0.841 | 0.06 | 2.026 |
| 0.57805304826041 | -0.838 | 0.062 | 2.027 |
| 0.58433623356759 | -0.834 | 0.064 | 2.028 |
| 0.590619418874769 | -0.831 | 0.066 | 2.029 |
| 0.596902604181949 | -0.827 | 0.068 | 2.03 |
| 0.603185789489129 | -0.824 | 0.071 | 2.032 |
| 0.609468974796308 | -0.82 | 0.073 | 2.033 |
| 0.615752160103488 | -0.816 | 0.075 | 2.034 |
| 0.622035345410668 | -0.813 | 0.077 | 2.036 |
| 0.628318530717847 | -0.809 | 0.079 | 2.037 |
| 0.634601716025027 | -0.805 | 0.082 | 2.039 |
| 0.640884901332206 | -0.802 | 0.084 | 2.04 |
| 0.647168086639386 | -0.798 | 0.087 | 2.042 |
| 0.653451271946566 | -0.794 | 0.089 | 2.043 |
| 0.659734457253745 | -0.79 | 0.092 | 2.045 |
| 0.666017642560925 | -0.786 | 0.094 | 2.047 |
| 0.672300827868105 | -0.782 | 0.097 | 2.049 |
| 0.678584013175284 | -0.778 | 0.099 | 2.05 |
| 0.684867198482464 | -0.775 | 0.102 | 2.052 |
| 0.691150383789644 | -0.771 | 0.105 | 2.054 |
| 0.697433569096823 | -0.766 | 0.108 | 2.056 |
| 0.703716754404003 | -0.762 | 0.111 | 2.058 |
| 0.709999939711183 | -0.758 | 0.113 | 2.06 |
| 0.716283125018362 | -0.754 | 0.116 | 2.062 |
| 0.722566310325542 | -0.75 | 0.119 | 2.064 |
| 0.728849495632721 | -0.746 | 0.122 | 2.066 |
| 0.735132680939901 | -0.742 | 0.125 | 2.069 |
| 0.741415866247081 | -0.738 | 0.129 | 2.071 |
| 0.74769905155426 | -0.733 | 0.132 | 2.073 |
| 0.75398223686144 | -0.729 | 0.135 | 2.076 |
| 0.76026542216862 | -0.725 | 0.138 | 2.078 |
| 0.766548607475799 | -0.72 | 0.142 | 2.081 |
| 0.772831792782979 | -0.716 | 0.145 | 2.083 |
| 0.779114978090159 | -0.712 | 0.148 | 2.086 |
| 0.785398163397338 | -0.707 | 0.152 | 2.089 |
| 0.791681348704518 | -0.703 | 0.155 | 2.092 |
| 0.797964534011697 | -0.698 | 0.159 | 2.094 |
| 0.804247719318877 | -0.694 | 0.162 | 2.097 |
| 0.810530904626057 | -0.689 | 0.166 | 2.1 |
| 0.816814089933236 | -0.685 | 0.17 | 2.103 |
| 0.823097275240416 | -0.68 | 0.174 | 2.106 |
| 0.829380460547596 | -0.675 | 0.177 | 2.109 |
| 0.835663645854775 | -0.671 | 0.181 | 2.113 |
| 0.841946831161955 | -0.666 | 0.185 | 2.116 |
| 0.848230016469135 | -0.661 | 0.189 | 2.119 |
| 0.854513201776314 | -0.657 | 0.193 | 2.123 |
| 0.860796387083494 | -0.652 | 0.197 | 2.126 |
| 0.867079572390674 | -0.647 | 0.201 | 2.13 |
| 0.873362757697853 | -0.642 | 0.206 | 2.133 |
| 0.879645943005033 | -0.637 | 0.21 | 2.137 |
| 0.885929128312212 | -0.633 | 0.214 | 2.141 |
| 0.892212313619392 | -0.628 | 0.218 | 2.145 |
| 0.898495498926572 | -0.623 | 0.223 | 2.149 |
| 0.904778684233751 | -0.618 | 0.227 | 2.153 |
| 0.911061869540931 | -0.613 | 0.232 | 2.157 |
| 0.917345054848111 | -0.608 | 0.236 | 2.161 |
| 0.92362824015529 | -0.603 | 0.241 | 2.165 |
| 0.92991142546247 | -0.598 | 0.246 | 2.17 |
| 0.93619461076965 | -0.593 | 0.25 | 2.174 |
| 0.942477796076829 | -0.588 | 0.255 | 2.178 |
| 0.948760981384009 | -0.583 | 0.26 | 2.183 |
| 0.955044166691188 | -0.578 | 0.265 | 2.188 |
| 0.961327351998368 | -0.572 | 0.27 | 2.192 |
| 0.967610537305548 | -0.567 | 0.275 | 2.197 |
| 0.973893722612727 | -0.562 | 0.28 | 2.202 |
| 0.980176907919907 | -0.557 | 0.285 | 2.207 |
| 0.986460093227087 | -0.552 | 0.29 | 2.212 |
| 0.992743278534266 | -0.546 | 0.295 | 2.217 |
| 0.999026463841446 | -0.541 | 0.3 | 2.222 |
| 1.005309649148626 | -0.536 | 0.306 | 2.228 |
| 1.011592834455805 | -0.531 | 0.311 | 2.233 |
| 1.017876019762985 | -0.525 | 0.316 | 2.239 |
| 1.024159205070164 | -0.52 | 0.322 | 2.244 |
| 1.030442390377344 | -0.514 | 0.327 | 2.25 |
| 1.036725575684524 | -0.509 | 0.333 | 2.256 |
| 1.043008760991703 | -0.504 | 0.339 | 2.262 |
| 1.049291946298883 | -0.498 | 0.344 | 2.267 |
| 1.055575131606063 | -0.493 | 0.35 | 2.274 |
| 1.061858316913242 | -0.487 | 0.356 | 2.28 |
| 1.068141502220422 | -0.482 | 0.362 | 2.286 |
| 1.074424687527602 | -0.476 | 0.368 | 2.292 |
| 1.080707872834781 | -0.471 | 0.374 | 2.299 |
| 1.086991058141961 | -0.465 | 0.38 | 2.305 |
| 1.09327424344914 | -0.46 | 0.386 | 2.312 |
| 1.09955742875632 | -0.454 | 0.392 | 2.319 |
| 1.1058406140635 | -0.448 | 0.398 | 2.325 |
| 1.112123799370679 | -0.443 | 0.404 | 2.332 |
| 1.11840698467786 | -0.437 | 0.411 | 2.339 |
| 1.124690169985039 | -0.431 | 0.417 | 2.346 |
| 1.130973355292218 | -0.426 | 0.423 | 2.354 |
| 1.137256540599398 | -0.42 | 0.43 | 2.361 |
| 1.143539725906578 | -0.414 | 0.436 | 2.368 |
| 1.149822911213757 | -0.409 | 0.443 | 2.376 |
| 1.156106096520937 | -0.403 | 0.449 | 2.384 |
| 1.162389281828116 | -0.397 | 0.456 | 2.391 |
| 1.168672467135296 | -0.391 | 0.463 | 2.399 |
| 1.174955652442476 | -0.386 | 0.47 | 2.407 |
| 1.181238837749655 | -0.38 | 0.476 | 2.415 |
| 1.187522023056835 | -0.374 | 0.483 | 2.423 |
| 1.193805208364015 | -0.368 | 0.49 | 2.432 |
| 1.200088393671194 | -0.362 | 0.497 | 2.44 |
| 1.206371578978374 | -0.356 | 0.504 | 2.448 |
| 1.212654764285554 | -0.351 | 0.511 | 2.457 |
| 1.218937949592733 | -0.345 | 0.519 | 2.466 |
| 1.225221134899913 | -0.339 | 0.526 | 2.475 |
| 1.231504320207093 | -0.333 | 0.533 | 2.483 |
| 1.237787505514272 | -0.327 | 0.54 | 2.493 |
| 1.244070690821452 | -0.321 | 0.548 | 2.502 |
| 1.250353876128631 | -0.315 | 0.555 | 2.511 |
| 1.256637061435811 | -0.309 | 0.563 | 2.52 |
| 1.262920246742991 | -0.303 | 0.57 | 2.53 |
| 1.26920343205017 | -0.297 | 0.578 | 2.539 |
| 1.27548661735735 | -0.291 | 0.585 | 2.549 |
| 1.28176980266453 | -0.285 | 0.593 | 2.559 |
| 1.28805298797171 | -0.279 | 0.601 | 2.569 |
| 1.294336173278889 | -0.273 | 0.609 | 2.579 |
| 1.300619358586069 | -0.267 | 0.617 | 2.589 |
| 1.306902543893248 | -0.261 | 0.624 | 2.599 |
| 1.313185729200428 | -0.255 | 0.632 | 2.61 |
| 1.319468914507607 | -0.249 | 0.64 | 2.62 |
| 1.325752099814787 | -0.243 | 0.649 | 2.631 |
| 1.332035285121967 | -0.236 | 0.657 | 2.642 |
| 1.338318470429146 | -0.23 | 0.665 | 2.653 |
| 1.344601655736326 | -0.224 | 0.673 | 2.664 |
| 1.350884841043506 | -0.218 | 0.681 | 2.675 |
| 1.357168026350685 | -0.212 | 0.69 | 2.686 |
| 1.363451211657865 | -0.206 | 0.698 | 2.698 |
| 1.369734396965045 | -0.2 | 0.706 | 2.709 |
| 1.376017582272224 | -0.194 | 0.715 | 2.721 |
| 1.382300767579404 | -0.187 | 0.723 | 2.732 |
| 1.388583952886583 | -0.181 | 0.732 | 2.744 |
| 1.394867138193763 | -0.175 | 0.74 | 2.756 |
| 1.401150323500943 | -0.169 | 0.749 | 2.768 |
| 1.407433508808122 | -0.163 | 0.758 | 2.781 |
| 1.413716694115302 | -0.156 | 0.767 | 2.793 |
| 1.419999879422482 | -0.15 | 0.775 | 2.805 |
| 1.426283064729661 | -0.144 | 0.784 | 2.818 |
| 1.432566250036841 | -0.138 | 0.793 | 2.831 |
| 1.438849435344021 | -0.132 | 0.802 | 2.843 |
| 1.4451326206512 | -0.125 | 0.811 | 2.856 |
| 1.45141580595838 | -0.119 | 0.82 | 2.869 |
| 1.45769899126556 | -0.113 | 0.829 | 2.883 |
| 1.46398217657274 | -0.107 | 0.838 | 2.896 |
| 1.470265361879919 | -0.1 | 0.847 | 2.909 |
| 1.476548547187098 | -0.094 | 0.857 | 2.923 |
| 1.482831732494278 | -0.088 | 0.866 | 2.937 |
| 1.489114917801458 | -0.082 | 0.875 | 2.951 |
| 1.495398103108637 | -0.075 | 0.885 | 2.965 |
| 1.501681288415817 | -0.069 | 0.894 | 2.979 |
| 1.507964473722997 | -0.063 | 0.903 | 2.993 |
| 1.514247659030176 | -0.057 | 0.913 | 3.007 |
| 1.520530844337356 | -0.05 | 0.922 | 3.022 |
| 1.526814029644536 | -0.044 | 0.932 | 3.036 |
| 1.533097214951715 | -0.038 | 0.942 | 3.051 |
| 1.539380400258895 | -0.031 | 0.951 | 3.066 |
| 1.545663585566075 | -0.025 | 0.961 | 3.081 |
| 1.551946770873254 | -0.019 | 0.971 | 3.096 |
| 1.558229956180434 | -0.013 | 0.98 | 3.111 |
| 1.564513141487613 | -0.006 | 0.99 | 3.126 |
| 1.570796326794793 | 0 | 1 | 3.142 |
| 1.577079512101973 | 0.006 | 1.01 | 3.157 |
| 1.583362697409152 | 0.013 | 1.02 | 3.173 |
| 1.589645882716332 | 0.019 | 1.03 | 3.189 |
| 1.595929068023512 | 0.025 | 1.04 | 3.205 |
| 1.602212253330691 | 0.031 | 1.05 | 3.221 |
| 1.608495438637871 | 0.038 | 1.06 | 3.237 |
| 1.61477862394505 | 0.044 | 1.07 | 3.253 |
| 1.62106180925223 | 0.05 | 1.08 | 3.27 |
| 1.62734499455941 | 0.057 | 1.09 | 3.286 |
| 1.633628179866589 | 0.063 | 1.101 | 3.303 |
| 1.63991136517377 | 0.069 | 1.111 | 3.32 |
| 1.646194550480949 | 0.075 | 1.121 | 3.337 |
| 1.652477735788128 | 0.082 | 1.131 | 3.354 |
| 1.658760921095308 | 0.088 | 1.142 | 3.371 |
| 1.665044106402488 | 0.094 | 1.152 | 3.388 |
| 1.671327291709667 | 0.1 | 1.163 | 3.405 |
| 1.677610477016847 | 0.107 | 1.173 | 3.423 |
| 1.683893662324026 | 0.113 | 1.184 | 3.441 |
| 1.690176847631206 | 0.119 | 1.194 | 3.458 |
| 1.696460032938386 | 0.125 | 1.205 | 3.476 |
| 1.702743218245565 | 0.132 | 1.215 | 3.494 |
| 1.709026403552745 | 0.138 | 1.226 | 3.512 |
| 1.715309588859925 | 0.144 | 1.237 | 3.531 |
| 1.721592774167104 | 0.15 | 1.247 | 3.549 |
| 1.727875959474284 | 0.156 | 1.258 | 3.567 |
| 1.734159144781464 | 0.163 | 1.269 | 3.586 |
| 1.740442330088643 | 0.169 | 1.279 | 3.605 |
| 1.746725515395823 | 0.175 | 1.29 | 3.623 |
| 1.753008700703003 | 0.181 | 1.301 | 3.642 |
| 1.759291886010182 | 0.187 | 1.312 | 3.661 |
| 1.765575071317362 | 0.194 | 1.323 | 3.681 |
| 1.771858256624541 | 0.2 | 1.334 | 3.7 |
| 1.778141441931721 | 0.206 | 1.345 | 3.719 |
| 1.784424627238901 | 0.212 | 1.356 | 3.739 |
| 1.79070781254608 | 0.218 | 1.367 | 3.758 |
| 1.79699099785326 | 0.224 | 1.378 | 3.778 |
| 1.80327418316044 | 0.23 | 1.389 | 3.798 |
| 1.809557368467619 | 0.236 | 1.4 | 3.818 |
| 1.815840553774799 | 0.243 | 1.411 | 3.838 |
| 1.822123739081979 | 0.249 | 1.422 | 3.858 |
| 1.828406924389158 | 0.255 | 1.433 | 3.878 |
| 1.834690109696338 | 0.261 | 1.444 | 3.899 |
| 1.840973295003518 | 0.267 | 1.455 | 3.919 |
| 1.847256480310697 | 0.273 | 1.466 | 3.94 |
| 1.853539665617877 | 0.279 | 1.477 | 3.96 |
| 1.859822850925056 | 0.285 | 1.489 | 3.981 |
| 1.866106036232236 | 0.291 | 1.5 | 4.002 |
| 1.872389221539416 | 0.297 | 1.511 | 4.023 |
| 1.878672406846595 | 0.303 | 1.522 | 4.044 |
| 1.884955592153775 | 0.309 | 1.534 | 4.065 |
| 1.891238777460955 | 0.315 | 1.545 | 4.087 |
| 1.897521962768134 | 0.321 | 1.556 | 4.108 |
| 1.903805148075314 | 0.327 | 1.567 | 4.129 |
| 1.910088333382494 | 0.333 | 1.579 | 4.151 |
| 1.916371518689673 | 0.339 | 1.59 | 4.173 |
| 1.922654703996853 | 0.345 | 1.601 | 4.194 |
| 1.928937889304033 | 0.351 | 1.613 | 4.216 |
| 1.935221074611212 | 0.356 | 1.624 | 4.238 |
| 1.941504259918392 | 0.362 | 1.635 | 4.26 |
| 1.947787445225571 | 0.368 | 1.647 | 4.282 |
| 1.954070630532751 | 0.374 | 1.658 | 4.305 |
| 1.960353815839931 | 0.38 | 1.67 | 4.327 |
| 1.96663700114711 | 0.386 | 1.681 | 4.349 |
| 1.97292018645429 | 0.391 | 1.692 | 4.372 |
| 1.97920337176147 | 0.397 | 1.704 | 4.394 |
| 1.985486557068649 | 0.403 | 1.715 | 4.417 |
| 1.991769742375829 | 0.409 | 1.727 | 4.44 |
| 1.998052927683009 | 0.414 | 1.738 | 4.462 |
| 2.004336112990188 | 0.42 | 1.749 | 4.485 |
| 2.010619298297368 | 0.426 | 1.761 | 4.508 |
| 2.016902483604547 | 0.431 | 1.772 | 4.531 |
| 2.023185668911727 | 0.437 | 1.784 | 4.554 |
| 2.029468854218907 | 0.443 | 1.795 | 4.578 |
| 2.035752039526086 | 0.448 | 1.807 | 4.601 |
| 2.042035224833266 | 0.454 | 1.818 | 4.624 |
| 2.048318410140446 | 0.46 | 1.83 | 4.647 |
| 2.054601595447625 | 0.465 | 1.841 | 4.671 |
| 2.060884780754805 | 0.471 | 1.852 | 4.694 |
| 2.067167966061984 | 0.476 | 1.864 | 4.718 |
| 2.073451151369164 | 0.482 | 1.875 | 4.742 |
| 2.079734336676344 | 0.487 | 1.887 | 4.765 |
| 2.086017521983524 | 0.493 | 1.898 | 4.789 |
| 2.092300707290703 | 0.498 | 1.909 | 4.813 |
| 2.098583892597883 | 0.504 | 1.921 | 4.837 |
| 2.104867077905062 | 0.509 | 1.932 | 4.861 |
| 2.111150263212242 | 0.514 | 1.944 | 4.885 |
| 2.117433448519422 | 0.52 | 1.955 | 4.909 |
| 2.123716633826601 | 0.525 | 1.966 | 4.933 |
| 2.129999819133781 | 0.531 | 1.978 | 4.957 |
| 2.136283004440961 | 0.536 | 1.989 | 4.981 |
| 2.14256618974814 | 0.541 | 2 | 5.005 |
| 2.14884937505532 | 0.546 | 2.012 | 5.03 |
| 2.1551325603625 | 0.552 | 2.023 | 5.054 |
| 2.16141574566968 | 0.557 | 2.034 | 5.078 |
| 2.167698930976859 | 0.562 | 2.046 | 5.103 |
| 2.173982116284038 | 0.567 | 2.057 | 5.127 |
| 2.180265301591218 | 0.572 | 2.068 | 5.152 |
| 2.186548486898398 | 0.578 | 2.079 | 5.176 |
| 2.192831672205577 | 0.583 | 2.09 | 5.201 |
| 2.199114857512757 | 0.588 | 2.102 | 5.225 |
| 2.205398042819936 | 0.593 | 2.113 | 5.25 |
| 2.211681228127116 | 0.598 | 2.124 | 5.274 |
| 2.217964413434296 | 0.603 | 2.135 | 5.299 |
| 2.224247598741475 | 0.608 | 2.146 | 5.324 |
| 2.230530784048655 | 0.613 | 2.157 | 5.348 |
| 2.236813969355835 | 0.618 | 2.168 | 5.373 |
| 2.243097154663014 | 0.623 | 2.179 | 5.398 |
| 2.249380339970194 | 0.628 | 2.19 | 5.423 |
| 2.255663525277374 | 0.633 | 2.201 | 5.447 |
| 2.261946710584553 | 0.637 | 2.212 | 5.472 |
| 2.268229895891733 | 0.642 | 2.223 | 5.497 |
| 2.274513081198912 | 0.647 | 2.234 | 5.522 |
| 2.280796266506092 | 0.652 | 2.245 | 5.547 |
| 2.287079451813272 | 0.657 | 2.256 | 5.571 |
| 2.293362637120452 | 0.661 | 2.267 | 5.596 |
| 2.299645822427631 | 0.666 | 2.278 | 5.621 |
| 2.305929007734811 | 0.671 | 2.288 | 5.646 |
| 2.312212193041991 | 0.675 | 2.299 | 5.67 |
| 2.31849537834917 | 0.68 | 2.31 | 5.695 |
| 2.32477856365635 | 0.685 | 2.32 | 5.72 |
| 2.331061748963529 | 0.689 | 2.331 | 5.745 |
| 2.337344934270709 | 0.694 | 2.342 | 5.769 |
| 2.343628119577889 | 0.698 | 2.352 | 5.794 |
| 2.349911304885068 | 0.703 | 2.363 | 5.819 |
| 2.356194490192248 | 0.707 | 2.373 | 5.844 |
| 2.362477675499428 | 0.712 | 2.384 | 5.868 |
| 2.368760860806607 | 0.716 | 2.394 | 5.893 |
| 2.375044046113787 | 0.72 | 2.404 | 5.917 |
| 2.381327231420966 | 0.725 | 2.415 | 5.942 |
| 2.387610416728146 | 0.729 | 2.425 | 5.967 |
| 2.393893602035326 | 0.733 | 2.435 | 5.991 |
| 2.400176787342505 | 0.738 | 2.445 | 6.016 |
| 2.406459972649685 | 0.742 | 2.456 | 6.04 |
| 2.412743157956865 | 0.746 | 2.466 | 6.064 |
| 2.419026343264044 | 0.75 | 2.476 | 6.089 |
| 2.425309528571224 | 0.754 | 2.486 | 6.113 |
| 2.431592713878404 | 0.758 | 2.496 | 6.137 |
| 2.437875899185583 | 0.762 | 2.506 | 6.161 |
| 2.444159084492763 | 0.766 | 2.516 | 6.186 |
| 2.450442269799943 | 0.771 | 2.526 | 6.21 |
| 2.456725455107122 | 0.775 | 2.535 | 6.234 |
| 2.463008640414302 | 0.778 | 2.545 | 6.258 |
| 2.469291825721482 | 0.782 | 2.555 | 6.281 |
| 2.475575011028661 | 0.786 | 2.564 | 6.305 |
| 2.481858196335841 | 0.79 | 2.574 | 6.329 |
| 2.48814138164302 | 0.794 | 2.583 | 6.353 |
| 2.4944245669502 | 0.798 | 2.593 | 6.376 |
| 2.50070775225738 | 0.802 | 2.602 | 6.4 |
| 2.506990937564559 | 0.805 | 2.612 | 6.423 |
| 2.51327412287174 | 0.809 | 2.621 | 6.447 |
| 2.519557308178919 | 0.813 | 2.63 | 6.47 |
| 2.525840493486098 | 0.816 | 2.64 | 6.493 |
| 2.532123678793278 | 0.82 | 2.649 | 6.516 |
| 2.538406864100458 | 0.824 | 2.658 | 6.539 |
| 2.544690049407637 | 0.827 | 2.667 | 6.562 |
| 2.550973234714817 | 0.831 | 2.676 | 6.585 |
| 2.557256420021996 | 0.834 | 2.685 | 6.608 |
| 2.563539605329176 | 0.838 | 2.693 | 6.63 |
| 2.569822790636356 | 0.841 | 2.702 | 6.653 |
| 2.576105975943535 | 0.844 | 2.711 | 6.675 |
| 2.582389161250715 | 0.848 | 2.72 | 6.698 |
| 2.588672346557895 | 0.851 | 2.728 | 6.72 |
| 2.594955531865074 | 0.854 | 2.737 | 6.742 |
| 2.601238717172254 | 0.858 | 2.745 | 6.764 |
| 2.607521902479433 | 0.861 | 2.753 | 6.786 |
| 2.613805087786613 | 0.864 | 2.762 | 6.807 |
| 2.620088273093793 | 0.867 | 2.77 | 6.829 |
| 2.626371458400972 | 0.87 | 2.778 | 6.85 |
| 2.632654643708152 | 0.873 | 2.786 | 6.871 |
| 2.638937829015332 | 0.876 | 2.794 | 6.893 |
| 2.645221014322511 | 0.879 | 2.802 | 6.914 |
| 2.651504199629691 | 0.882 | 2.81 | 6.934 |
| 2.657787384936871 | 0.885 | 2.818 | 6.955 |
| 2.66407057024405 | 0.888 | 2.826 | 6.976 |
| 2.67035375555123 | 0.891 | 2.833 | 6.996 |
| 2.67663694085841 | 0.894 | 2.841 | 7.016 |
| 2.682920126165589 | 0.897 | 2.848 | 7.037 |
| 2.689203311472769 | 0.899 | 2.856 | 7.057 |
| 2.695486496779948 | 0.902 | 2.863 | 7.076 |
| 2.701769682087128 | 0.905 | 2.87 | 7.096 |
| 2.708052867394308 | 0.907 | 2.878 | 7.115 |
| 2.714336052701487 | 0.91 | 2.885 | 7.135 |
| 2.720619238008667 | 0.913 | 2.892 | 7.154 |
| 2.726902423315847 | 0.915 | 2.899 | 7.173 |
| 2.733185608623026 | 0.918 | 2.906 | 7.191 |
| 2.739468793930206 | 0.92 | 2.912 | 7.21 |
| 2.745751979237386 | 0.923 | 2.919 | 7.228 |
| 2.752035164544565 | 0.925 | 2.926 | 7.246 |
| 2.758318349851745 | 0.927 | 2.932 | 7.264 |
| 2.764601535158925 | 0.93 | 2.939 | 7.282 |
| 2.770884720466104 | 0.932 | 2.945 | 7.3 |
| 2.777167905773284 | 0.934 | 2.951 | 7.317 |
| 2.783451091080463 | 0.937 | 2.957 | 7.334 |
| 2.789734276387643 | 0.939 | 2.963 | 7.351 |
| 2.796017461694823 | 0.941 | 2.969 | 7.368 |
| 2.802300647002002 | 0.943 | 2.975 | 7.385 |
| 2.808583832309182 | 0.945 | 2.981 | 7.401 |
| 2.814867017616362 | 0.947 | 2.987 | 7.417 |
| 2.821150202923541 | 0.949 | 2.993 | 7.433 |
| 2.827433388230721 | 0.951 | 2.998 | 7.448 |
| 2.833716573537901 | 0.953 | 3.004 | 7.464 |
| 2.83999975884508 | 0.955 | 3.009 | 7.479 |
| 2.84628294415226 | 0.957 | 3.014 | 7.494 |
| 2.852566129459439 | 0.959 | 3.019 | 7.509 |
| 2.858849314766619 | 0.96 | 3.024 | 7.523 |
| 2.865132500073799 | 0.962 | 3.029 | 7.537 |
| 2.871415685380978 | 0.964 | 3.034 | 7.551 |
| 2.877698870688158 | 0.965 | 3.039 | 7.565 |
| 2.883982055995337 | 0.967 | 3.044 | 7.578 |
| 2.890265241302517 | 0.969 | 3.048 | 7.592 |
| 2.896548426609697 | 0.97 | 3.053 | 7.605 |
| 2.902831611916877 | 0.972 | 3.057 | 7.617 |
| 2.909114797224056 | 0.973 | 3.061 | 7.63 |
| 2.915397982531236 | 0.975 | 3.065 | 7.642 |
| 2.921681167838416 | 0.976 | 3.069 | 7.653 |
| 2.927964353145595 | 0.977 | 3.073 | 7.665 |
| 2.934247538452775 | 0.979 | 3.077 | 7.676 |
| 2.940530723759954 | 0.98 | 3.081 | 7.687 |
| 2.946813909067134 | 0.981 | 3.085 | 7.698 |
| 2.953097094374314 | 0.982 | 3.088 | 7.708 |
| 2.959380279681493 | 0.983 | 3.092 | 7.719 |
| 2.965663464988673 | 0.985 | 3.095 | 7.728 |
| 2.971946650295853 | 0.986 | 3.098 | 7.738 |
| 2.978229835603032 | 0.987 | 3.101 | 7.747 |
| 2.984513020910212 | 0.988 | 3.104 | 7.756 |
| 2.990796206217391 | 0.989 | 3.107 | 7.765 |
| 2.997079391524571 | 0.99 | 3.11 | 7.773 |
| 3.003362576831751 | 0.99 | 3.113 | 7.781 |
| 3.009645762138931 | 0.991 | 3.115 | 7.789 |
| 3.01592894744611 | 0.992 | 3.117 | 7.796 |
| 3.02221213275329 | 0.993 | 3.12 | 7.803 |
| 3.028495318060469 | 0.994 | 3.122 | 7.81 |
| 3.034778503367649 | 0.994 | 3.124 | 7.816 |
| 3.041061688674829 | 0.995 | 3.126 | 7.822 |
| 3.047344873982008 | 0.996 | 3.128 | 7.828 |
| 3.053628059289188 | 0.996 | 3.13 | 7.833 |
| 3.059911244596367 | 0.997 | 3.131 | 7.838 |
| 3.066194429903547 | 0.997 | 3.133 | 7.842 |
| 3.072477615210727 | 0.998 | 3.134 | 7.847 |
| 3.078760800517906 | 0.998 | 3.135 | 7.851 |
| 3.085043985825086 | 0.998 | 3.137 | 7.854 |
| 3.091327171132266 | 0.999 | 3.138 | 7.857 |
| 3.097610356439445 | 0.999 | 3.139 | 7.86 |
| 3.103893541746625 | 0.999 | 3.139 | 7.863 |
| 3.110176727053805 | 1 | 3.14 | 7.865 |
| 3.116459912360984 | 1 | 3.141 | 7.867 |
| 3.122743097668164 | 1 | 3.141 | 7.868 |
| 3.129026282975343 | 1 | 3.141 | 7.869 |
| 3.135309468282523 | 1 | 3.142 | 7.869 |
| 3.141592653589703 | 1 | 3.142 | 7.87 |
| 3.147875838896883 | 1 | 3.142 | 7.869 |
| 3.154159024204062 | 1 | 3.141 | 7.869 |
| 3.160442209511242 | 1 | 3.141 | 7.868 |
| 3.166725394818422 | 1 | 3.141 | 7.866 |
| 3.173008580125601 | 1 | 3.14 | 7.865 |
| 3.179291765432781 | 0.999 | 3.139 | 7.862 |
| 3.18557495073996 | 0.999 | 3.139 | 7.86 |
| 3.19185813604714 | 0.999 | 3.138 | 7.857 |
| 3.19814132135432 | 0.998 | 3.137 | 7.853 |
| 3.2044245066615 | 0.998 | 3.135 | 7.85 |
| 3.210707691968679 | 0.998 | 3.134 | 7.845 |
| 3.216990877275859 | 0.997 | 3.133 | 7.841 |
| 3.223274062583038 | 0.997 | 3.131 | 7.836 |
| 3.229557247890217 | 0.996 | 3.129 | 7.83 |
| 3.235840433197398 | 0.996 | 3.127 | 7.824 |
| 3.242123618504577 | 0.995 | 3.125 | 7.818 |
| 3.248406803811757 | 0.994 | 3.123 | 7.811 |
| 3.254689989118936 | 0.994 | 3.121 | 7.803 |
| 3.260973174426116 | 0.993 | 3.119 | 7.796 |
| 3.267256359733296 | 0.992 | 3.116 | 7.788 |
| 3.273539545040475 | 0.991 | 3.114 | 7.779 |
| 3.279822730347655 | 0.99 | 3.111 | 7.77 |
| 3.286105915654835 | 0.99 | 3.108 | 7.76 |
| 3.292389100962014 | 0.989 | 3.105 | 7.75 |
| 3.298672286269194 | 0.988 | 3.102 | 7.74 |
| 3.304955471576374 | 0.987 | 3.098 | 7.729 |
| 3.311238656883553 | 0.986 | 3.095 | 7.718 |
| 3.317521842190732 | 0.985 | 3.091 | 7.706 |
| 3.323805027497912 | 0.983 | 3.088 | 7.693 |
| 3.330088212805092 | 0.982 | 3.084 | 7.68 |
| 3.336371398112272 | 0.981 | 3.08 | 7.667 |
| 3.342654583419451 | 0.98 | 3.076 | 7.653 |
| 3.34893776872663 | 0.979 | 3.071 | 7.639 |
| 3.355220954033811 | 0.977 | 3.067 | 7.624 |
| 3.36150413934099 | 0.976 | 3.062 | 7.609 |
| 3.36778732464817 | 0.975 | 3.058 | 7.593 |
| 3.37407050995535 | 0.973 | 3.053 | 7.577 |
| 3.380353695262529 | 0.972 | 3.048 | 7.56 |
| 3.386636880569709 | 0.97 | 3.043 | 7.543 |
| 3.392920065876888 | 0.969 | 3.038 | 7.526 |
| 3.399203251184068 | 0.967 | 3.032 | 7.507 |
| 3.405486436491248 | 0.965 | 3.027 | 7.489 |
| 3.411769621798427 | 0.964 | 3.021 | 7.469 |
| 3.418052807105607 | 0.962 | 3.015 | 7.449 |
| 3.424335992412787 | 0.96 | 3.009 | 7.429 |
| 3.430619177719966 | 0.959 | 3.003 | 7.408 |
| 3.436902363027146 | 0.957 | 2.997 | 7.387 |
| 3.443185548334325 | 0.955 | 2.991 | 7.365 |
| 3.449468733641505 | 0.953 | 2.984 | 7.343 |
| 3.455751918948685 | 0.951 | 2.978 | 7.32 |
| 3.462035104255865 | 0.949 | 2.971 | 7.296 |
| 3.468318289563044 | 0.947 | 2.964 | 7.272 |
| 3.474601474870224 | 0.945 | 2.957 | 7.248 |
| 3.480884660177403 | 0.943 | 2.95 | 7.223 |
| 3.487167845484583 | 0.941 | 2.942 | 7.197 |
| 3.493451030791763 | 0.939 | 2.935 | 7.171 |
| 3.499734216098942 | 0.937 | 2.927 | 7.144 |
| 3.506017401406122 | 0.934 | 2.919 | 7.117 |
| 3.512300586713302 | 0.932 | 2.911 | 7.089 |
| 3.518583772020481 | 0.93 | 2.903 | 7.061 |
| 3.524866957327661 | 0.927 | 2.895 | 7.032 |
| 3.531150142634841 | 0.925 | 2.887 | 7.003 |
| 3.53743332794202 | 0.923 | 2.878 | 6.973 |
| 3.5437165132492 | 0.92 | 2.87 | 6.942 |
| 3.54999969855638 | 0.918 | 2.861 | 6.911 |
| 3.556282883863559 | 0.915 | 2.852 | 6.879 |
| 3.562566069170739 | 0.913 | 2.843 | 6.847 |
| 3.568849254477918 | 0.91 | 2.834 | 6.814 |
| 3.575132439785098 | 0.907 | 2.824 | 6.78 |
| 3.581415625092278 | 0.905 | 2.815 | 6.746 |
| 3.587698810399457 | 0.902 | 2.805 | 6.712 |
| 3.593981995706637 | 0.899 | 2.795 | 6.677 |
| 3.600265181013817 | 0.897 | 2.785 | 6.641 |
| 3.606548366320996 | 0.894 | 2.775 | 6.604 |
| 3.612831551628176 | 0.891 | 2.765 | 6.568 |
| 3.619114736935355 | 0.888 | 2.755 | 6.53 |
| 3.625397922242535 | 0.885 | 2.744 | 6.492 |
| 3.631681107549715 | 0.882 | 2.733 | 6.453 |
| 3.637964292856894 | 0.879 | 2.723 | 6.414 |
| 3.644247478164074 | 0.876 | 2.712 | 6.374 |
| 3.650530663471254 | 0.873 | 2.701 | 6.333 |
| 3.656813848778433 | 0.87 | 2.689 | 6.292 |
| 3.663097034085613 | 0.867 | 2.678 | 6.251 |
| 3.669380219392792 | 0.864 | 2.666 | 6.208 |
| 3.675663404699972 | 0.861 | 2.655 | 6.165 |
| 3.681946590007152 | 0.858 | 2.643 | 6.122 |
| 3.688229775314331 | 0.854 | 2.631 | 6.078 |
| 3.694512960621511 | 0.851 | 2.619 | 6.033 |
| 3.700796145928691 | 0.848 | 2.607 | 5.988 |
| 3.70707933123587 | 0.844 | 2.594 | 5.942 |
| 3.71336251654305 | 0.841 | 2.582 | 5.895 |
| 3.71964570185023 | 0.838 | 2.569 | 5.848 |
| 3.72592888715741 | 0.834 | 2.556 | 5.8 |
| 3.732212072464589 | 0.831 | 2.543 | 5.752 |
| 3.738495257771769 | 0.827 | 2.53 | 5.703 |
| 3.744778443078948 | 0.824 | 2.517 | 5.653 |
| 3.751061628386128 | 0.82 | 2.503 | 5.603 |
| 3.757344813693308 | 0.816 | 2.49 | 5.552 |
| 3.763627999000487 | 0.813 | 2.476 | 5.5 |
| 3.769911184307667 | 0.809 | 2.462 | 5.448 |
| 3.776194369614846 | 0.805 | 2.448 | 5.395 |
| 3.782477554922026 | 0.802 | 2.434 | 5.342 |
| 3.788760740229206 | 0.798 | 2.42 | 5.288 |
| 3.795043925536385 | 0.794 | 2.405 | 5.233 |
| 3.801327110843565 | 0.79 | 2.391 | 5.178 |
| 3.807610296150745 | 0.786 | 2.376 | 5.122 |
| 3.813893481457924 | 0.782 | 2.361 | 5.065 |
| 3.820176666765104 | 0.778 | 2.346 | 5.008 |
| 3.826459852072284 | 0.775 | 2.331 | 4.95 |
| 3.832743037379463 | 0.771 | 2.316 | 4.892 |
| 3.839026222686643 | 0.766 | 2.3 | 4.832 |
| 3.845309407993823 | 0.762 | 2.285 | 4.773 |
| 3.851592593301002 | 0.758 | 2.269 | 4.712 |
| 3.857875778608182 | 0.754 | 2.253 | 4.651 |
| 3.864158963915361 | 0.75 | 2.237 | 4.589 |
| 3.870442149222541 | 0.746 | 2.221 | 4.527 |
| 3.876725334529721 | 0.742 | 2.205 | 4.464 |
| 3.8830085198369 | 0.738 | 2.188 | 4.4 |
| 3.88929170514408 | 0.733 | 2.172 | 4.336 |
| 3.89557489045126 | 0.729 | 2.155 | 4.271 |
| 3.901858075758439 | 0.725 | 2.138 | 4.206 |
| 3.908141261065619 | 0.72 | 2.121 | 4.139 |
| 3.914424446372799 | 0.716 | 2.104 | 4.072 |
| 3.920707631679978 | 0.712 | 2.087 | 4.005 |
| 3.926990816987158 | 0.707 | 2.07 | 3.937 |
| 3.933274002294337 | 0.703 | 2.052 | 3.868 |
| 3.939557187601517 | 0.698 | 2.035 | 3.798 |
| 3.945840372908697 | 0.694 | 2.017 | 3.728 |
| 3.952123558215876 | 0.689 | 1.999 | 3.657 |
| 3.958406743523056 | 0.685 | 1.981 | 3.586 |
| 3.964689928830236 | 0.68 | 1.963 | 3.514 |
| 3.970973114137415 | 0.675 | 1.944 | 3.441 |
| 3.977256299444595 | 0.671 | 1.926 | 3.368 |
| 3.983539484751775 | 0.666 | 1.907 | 3.294 |
| 3.989822670058954 | 0.661 | 1.888 | 3.219 |
| 3.996105855366134 | 0.657 | 1.87 | 3.144 |
| 4.002389040673314 | 0.652 | 1.851 | 3.068 |
| 4.008672225980493 | 0.647 | 1.831 | 2.991 |
| 4.014955411287672 | 0.642 | 1.812 | 2.914 |
| 4.021238596594851 | 0.637 | 1.793 | 2.836 |
| 4.02752178190203 | 0.633 | 1.773 | 2.757 |
| 4.03380496720921 | 0.628 | 1.754 | 2.678 |
| 4.040088152516389 | 0.623 | 1.734 | 2.598 |
| 4.046371337823567 | 0.618 | 1.714 | 2.517 |
| 4.052654523130747 | 0.613 | 1.694 | 2.436 |
| 4.058937708437926 | 0.608 | 1.674 | 2.354 |
| 4.065220893745105 | 0.603 | 1.653 | 2.272 |
| 4.071504079052285 | 0.598 | 1.633 | 2.189 |
| 4.077787264359464 | 0.593 | 1.612 | 2.105 |
| 4.084070449666643 | 0.588 | 1.592 | 2.02 |
| 4.090353634973822 | 0.583 | 1.571 | 1.935 |
| 4.096636820281001 | 0.578 | 1.55 | 1.849 |
| 4.102920005588181 | 0.572 | 1.529 | 1.763 |
| 4.10920319089536 | 0.567 | 1.507 | 1.676 |
| 4.115486376202539 | 0.562 | 1.486 | 1.588 |
| 4.121769561509718 | 0.557 | 1.465 | 1.5 |
| 4.128052746816897 | 0.552 | 1.443 | 1.411 |
| 4.134335932124077 | 0.546 | 1.421 | 1.321 |
| 4.140619117431256 | 0.541 | 1.4 | 1.231 |
| 4.146902302738435 | 0.536 | 1.378 | 1.14 |
| 4.153185488045614 | 0.531 | 1.356 | 1.049 |
| 4.159468673352793 | 0.525 | 1.333 | 0.956 |
| 4.165751858659973 | 0.52 | 1.311 | 0.864 |
| 4.172035043967152 | 0.514 | 1.289 | 0.77 |
| 4.178318229274331 | 0.509 | 1.266 | 0.676 |
| 4.18460141458151 | 0.504 | 1.244 | 0.581 |
| 4.190884599888689 | 0.498 | 1.221 | 0.486 |
| 4.197167785195868 | 0.493 | 1.198 | 0.39 |
| 4.203450970503048 | 0.487 | 1.175 | 0.293 |
| 4.209734155810227 | 0.482 | 1.152 | 0.196 |
| 4.216017341117406 | 0.476 | 1.129 | 0.098 |
| 4.222300526424585 | 0.471 | 1.105 | 0 |
| 4.228583711731764 | 0.465 | 1.082 | -0.1 |
| 4.234866897038944 | 0.46 | 1.058 | -0.199 |
| 4.241150082346122 | 0.454 | 1.034 | -0.3 |
| 4.247433267653302 | 0.448 | 1.011 | -0.401 |
| 4.253716452960481 | 0.443 | 0.987 | -0.502 |
| 4.25999963826766 | 0.437 | 0.963 | -0.605 |
| 4.26628282357484 | 0.431 | 0.939 | -0.707 |
| 4.272566008882019 | 0.426 | 0.914 | -0.811 |
| 4.278849194189198 | 0.42 | 0.89 | -0.915 |
| 4.285132379496377 | 0.414 | 0.866 | -1.02 |
| 4.291415564803557 | 0.409 | 0.841 | -1.125 |
| 4.297698750110735 | 0.403 | 0.816 | -1.231 |
| 4.303981935417915 | 0.397 | 0.792 | -1.337 |
| 4.310265120725094 | 0.391 | 0.767 | -1.445 |
| 4.316548306032273 | 0.386 | 0.742 | -1.552 |
| 4.322831491339452 | 0.38 | 0.717 | -1.661 |
| 4.329114676646632 | 0.374 | 0.691 | -1.769 |
| 4.335397861953811 | 0.368 | 0.666 | -1.879 |
| 4.34168104726099 | 0.362 | 0.641 | -1.989 |
| 4.347964232568169 | 0.356 | 0.615 | -2.1 |
| 4.354247417875348 | 0.351 | 0.59 | -2.211 |
| 4.360530603182528 | 0.345 | 0.564 | -2.323 |
| 4.366813788489707 | 0.339 | 0.538 | -2.435 |
| 4.373096973796886 | 0.333 | 0.512 | -2.548 |
| 4.379380159104065 | 0.327 | 0.487 | -2.662 |
| 4.385663344411244 | 0.321 | 0.46 | -2.776 |
| 4.391946529718424 | 0.315 | 0.434 | -2.891 |
| 4.398229715025602 | 0.309 | 0.408 | -3.006 |
| 4.404512900332782 | 0.303 | 0.382 | -3.122 |
| 4.41079608563996 | 0.297 | 0.355 | -3.239 |
| 4.41707927094714 | 0.291 | 0.329 | -3.356 |
| 4.42336245625432 | 0.285 | 0.302 | -3.473 |
| 4.429645641561499 | 0.279 | 0.276 | -3.591 |
| 4.435928826868678 | 0.273 | 0.249 | -3.71 |
| 4.442212012175857 | 0.267 | 0.222 | -3.829 |
| 4.448495197483036 | 0.261 | 0.195 | -3.949 |
| 4.454778382790215 | 0.255 | 0.168 | -4.069 |
| 4.461061568097395 | 0.249 | 0.141 | -4.19 |
| 4.467344753404574 | 0.243 | 0.114 | -4.311 |
| 4.473627938711753 | 0.236 | 0.086 | -4.433 |
| 4.479911124018932 | 0.23 | 0.059 | -4.556 |
| 4.486194309326112 | 0.224 | 0.032 | -4.679 |
| 4.49247749463329 | 0.218 | 0.004 | -4.802 |
| 4.49876067994047 | 0.212 | -0.023 | -4.926 |
| 4.50504386524765 | 0.206 | -0.051 | -5.051 |
| 4.511327050554828 | 0.2 | -0.079 | -5.176 |
| 4.517610235862008 | 0.194 | -0.107 | -5.301 |
| 4.523893421169186 | 0.187 | -0.135 | -5.427 |
| 4.530176606476366 | 0.181 | -0.163 | -5.554 |
| 4.536459791783545 | 0.175 | -0.191 | -5.681 |
| 4.542742977090724 | 0.169 | -0.219 | -5.809 |
| 4.549026162397904 | 0.163 | -0.247 | -5.937 |
| 4.555309347705083 | 0.156 | -0.275 | -6.065 |
| 4.561592533012262 | 0.15 | -0.303 | -6.194 |
| 4.567875718319441 | 0.144 | -0.332 | -6.324 |
| 4.57415890362662 | 0.138 | -0.36 | -6.454 |
| 4.5804420889338 | 0.132 | -0.389 | -6.584 |
| 4.586725274240979 | 0.125 | -0.417 | -6.715 |
| 4.593008459548158 | 0.119 | -0.446 | -6.846 |
| 4.599291644855337 | 0.113 | -0.475 | -6.978 |
| 4.605574830162516 | 0.107 | -0.503 | -7.111 |
| 4.611858015469695 | 0.1 | -0.532 | -7.243 |
| 4.618141200776875 | 0.094 | -0.561 | -7.376 |
| 4.624424386084054 | 0.088 | -0.59 | -7.51 |
| 4.630707571391233 | 0.082 | -0.619 | -7.644 |
| 4.636990756698412 | 0.075 | -0.648 | -7.779 |
| 4.643273942005591 | 0.069 | -0.677 | -7.914 |
| 4.649557127312771 | 0.063 | -0.706 | -8.049 |
| 4.65584031261995 | 0.057 | -0.735 | -8.185 |
| 4.66212349792713 | 0.05 | -0.764 | -8.321 |
| 4.668406683234308 | 0.044 | -0.794 | -8.457 |
| 4.674689868541487 | 0.038 | -0.823 | -8.594 |
| 4.680973053848666 | 0.031 | -0.852 | -8.732 |
| 4.687256239155846 | 0.025 | -0.882 | -8.87 |
| 4.693539424463024 | 0.019 | -0.911 | -9.008 |
| 4.699822609770204 | 0.013 | -0.941 | -9.146 |
| 4.706105795077383 | 0.006 | -0.97 | -9.285 |
| 4.712388980384562 | 0 | -1 | -9.425 |
| 4.718672165691741 | -0.006 | -1.03 | -9.564 |
| 4.724955350998921 | -0.013 | -1.059 | -9.705 |
| 4.7312385363061 | -0.019 | -1.089 | -9.845 |
| 4.73752172161328 | -0.025 | -1.119 | -9.986 |
| 4.743804906920459 | -0.031 | -1.149 | -10.127 |
| 4.750088092227637 | -0.038 | -1.178 | -10.268 |
| 4.756371277534817 | -0.044 | -1.208 | -10.41 |
| 4.762654462841996 | -0.05 | -1.238 | -10.552 |
| 4.768937648149175 | -0.057 | -1.268 | -10.695 |
| 4.775220833456354 | -0.063 | -1.298 | -10.838 |
| 4.781504018763534 | -0.069 | -1.328 | -10.981 |
| 4.787787204070713 | -0.075 | -1.358 | -11.124 |
| 4.794070389377892 | -0.082 | -1.388 | -11.268 |
| 4.800353574685071 | -0.088 | -1.418 | -11.412 |
| 4.806636759992251 | -0.094 | -1.448 | -11.557 |
| 4.81291994529943 | -0.1 | -1.478 | -11.701 |
| 4.819203130606608 | -0.107 | -1.508 | -11.846 |
| 4.825486315913788 | -0.113 | -1.538 | -11.991 |
| 4.831769501220967 | -0.119 | -1.568 | -12.137 |
| 4.838052686528146 | -0.125 | -1.598 | -12.283 |
| 4.844335871835326 | -0.132 | -1.629 | -12.429 |
| 4.850619057142505 | -0.138 | -1.659 | -12.575 |
| 4.856902242449684 | -0.144 | -1.689 | -12.722 |
| 4.863185427756863 | -0.15 | -1.719 | -12.868 |
| 4.869468613064042 | -0.156 | -1.749 | -13.015 |
| 4.875751798371221 | -0.163 | -1.78 | -13.163 |
| 4.882034983678401 | -0.169 | -1.81 | -13.31 |
| 4.88831816898558 | -0.175 | -1.84 | -13.458 |
| 4.894601354292759 | -0.181 | -1.87 | -13.606 |
| 4.900884539599939 | -0.187 | -1.901 | -13.754 |
| 4.907167724907117 | -0.194 | -1.931 | -13.902 |
| 4.913450910214297 | -0.2 | -1.961 | -14.051 |
| 4.919734095521476 | -0.206 | -1.991 | -14.2 |
| 4.926017280828655 | -0.212 | -2.022 | -14.349 |
| 4.932300466135834 | -0.218 | -2.052 | -14.498 |
| 4.938583651443014 | -0.224 | -2.082 | -14.647 |
| 4.944866836750193 | -0.23 | -2.112 | -14.796 |
| 4.951150022057372 | -0.236 | -2.143 | -14.946 |
| 4.957433207364551 | -0.243 | -2.173 | -15.096 |
| 4.96371639267173 | -0.249 | -2.203 | -15.246 |
| 4.96999957797891 | -0.255 | -2.233 | -15.396 |
| 4.976282763286088 | -0.261 | -2.263 | -15.546 |
| 4.982565948593268 | -0.267 | -2.294 | -15.696 |
| 4.988849133900447 | -0.273 | -2.324 | -15.846 |
| 4.995132319207626 | -0.279 | -2.354 | -15.997 |
| 5.001415504514805 | -0.285 | -2.384 | -16.147 |
| 5.007698689821984 | -0.291 | -2.414 | -16.298 |
| 5.013981875129164 | -0.297 | -2.444 | -16.449 |
| 5.020265060436343 | -0.303 | -2.474 | -16.6 |
| 5.026548245743522 | -0.309 | -2.504 | -16.751 |
| 5.032831431050702 | -0.315 | -2.534 | -16.902 |
| 5.039114616357881 | -0.321 | -2.564 | -17.053 |
| 5.04539780166506 | -0.327 | -2.594 | -17.204 |
| 5.05168098697224 | -0.333 | -2.624 | -17.355 |
| 5.057964172279418 | -0.339 | -2.654 | -17.506 |
| 5.064247357586598 | -0.345 | -2.684 | -17.658 |
| 5.070530542893777 | -0.351 | -2.714 | -17.809 |
| 5.076813728200956 | -0.356 | -2.744 | -17.96 |
| 5.083096913508135 | -0.362 | -2.774 | -18.111 |
| 5.089380098815314 | -0.368 | -2.803 | -18.263 |
| 5.095663284122493 | -0.374 | -2.833 | -18.414 |
| 5.101946469429673 | -0.38 | -2.863 | -18.565 |
| 5.108229654736852 | -0.386 | -2.892 | -18.717 |
| 5.114512840044031 | -0.391 | -2.922 | -18.868 |
| 5.12079602535121 | -0.397 | -2.951 | -19.019 |
| 5.12707921065839 | -0.403 | -2.981 | -19.17 |
| 5.133362395965568 | -0.409 | -3.01 | -19.322 |
| 5.139645581272747 | -0.414 | -3.04 | -19.473 |
| 5.145928766579927 | -0.42 | -3.069 | -19.624 |
| 5.152211951887106 | -0.426 | -3.099 | -19.775 |
| 5.158495137194286 | -0.431 | -3.128 | -19.925 |
| 5.164778322501465 | -0.437 | -3.157 | -20.076 |
| 5.171061507808644 | -0.443 | -3.186 | -20.227 |
| 5.177344693115823 | -0.448 | -3.215 | -20.378 |
| 5.183627878423002 | -0.454 | -3.244 | -20.528 |
| 5.189911063730181 | -0.46 | -3.273 | -20.678 |
| 5.196194249037361 | -0.465 | -3.302 | -20.829 |
| 5.20247743434454 | -0.471 | -3.331 | -20.979 |
| 5.20876061965172 | -0.476 | -3.36 | -21.129 |
| 5.215043804958898 | -0.482 | -3.389 | -21.279 |
| 5.221326990266077 | -0.487 | -3.417 | -21.428 |
| 5.227610175573257 | -0.493 | -3.446 | -21.578 |
| 5.233893360880435 | -0.498 | -3.475 | -21.727 |
| 5.240176546187615 | -0.504 | -3.503 | -21.876 |
| 5.246459731494794 | -0.509 | -3.531 | -22.025 |
| 5.252742916801973 | -0.514 | -3.56 | -22.174 |
| 5.259026102109152 | -0.52 | -3.588 | -22.322 |
| 5.265309287416332 | -0.525 | -3.616 | -22.471 |
| 5.27159247272351 | -0.531 | -3.644 | -22.619 |
| 5.27787565803069 | -0.536 | -3.672 | -22.767 |
| 5.284158843337869 | -0.541 | -3.7 | -22.914 |
| 5.290442028645049 | -0.546 | -3.728 | -23.062 |
| 5.296725213952227 | -0.552 | -3.756 | -23.209 |
| 5.303008399259407 | -0.557 | -3.784 | -23.356 |
| 5.309291584566586 | -0.562 | -3.811 | -23.503 |
| 5.315574769873765 | -0.567 | -3.839 | -23.649 |
| 5.321857955180945 | -0.572 | -3.866 | -23.795 |
| 5.328141140488124 | -0.578 | -3.894 | -23.941 |
| 5.334424325795303 | -0.583 | -3.921 | -24.086 |
| 5.340707511102482 | -0.588 | -3.948 | -24.231 |
| 5.346990696409661 | -0.593 | -3.975 | -24.376 |
| 5.35327388171684 | -0.598 | -4.002 | -24.521 |
| 5.35955706702402 | -0.603 | -4.029 | -24.665 |
| 5.365840252331199 | -0.608 | -4.056 | -24.809 |
| 5.372123437638378 | -0.613 | -4.083 | -24.952 |
| 5.378406622945557 | -0.618 | -4.109 | -25.095 |
| 5.384689808252737 | -0.623 | -4.136 | -25.238 |
| 5.390972993559916 | -0.628 | -4.162 | -25.38 |
| 5.397256178867095 | -0.633 | -4.189 | -25.522 |
| 5.403539364174274 | -0.637 | -4.215 | -25.664 |
| 5.409822549481453 | -0.642 | -4.241 | -25.805 |
| 5.416105734788632 | -0.647 | -4.267 | -25.946 |
| 5.422388920095812 | -0.652 | -4.293 | -26.086 |
| 5.42867210540299 | -0.657 | -4.319 | -26.226 |
| 5.43495529071017 | -0.661 | -4.344 | -26.365 |
| 5.44123847601735 | -0.666 | -4.37 | -26.504 |
| 5.447521661324528 | -0.671 | -4.395 | -26.643 |
| 5.453804846631708 | -0.675 | -4.421 | -26.781 |
| 5.460088031938887 | -0.68 | -4.446 | -26.919 |
| 5.466371217246066 | -0.685 | -4.471 | -27.056 |
| 5.472654402553245 | -0.689 | -4.496 | -27.192 |
| 5.478937587860424 | -0.694 | -4.521 | -27.328 |
| 5.485220773167603 | -0.698 | -4.546 | -27.464 |
| 5.491503958474783 | -0.703 | -4.57 | -27.599 |
| 5.497787143781962 | -0.707 | -4.595 | -27.734 |
| 5.504070329089141 | -0.712 | -4.619 | -27.868 |
| 5.51035351439632 | -0.716 | -4.643 | -28.001 |
| 5.5166366997035 | -0.72 | -4.667 | -28.134 |
| 5.522919885010679 | -0.725 | -4.691 | -28.266 |
| 5.529203070317858 | -0.729 | -4.715 | -28.398 |
| 5.535486255625037 | -0.733 | -4.739 | -28.529 |
| 5.541769440932216 | -0.738 | -4.762 | -28.66 |
| 5.548052626239396 | -0.742 | -4.786 | -28.79 |
| 5.554335811546575 | -0.746 | -4.809 | -28.919 |
| 5.560618996853754 | -0.75 | -4.832 | -29.048 |
| 5.566902182160933 | -0.754 | -4.855 | -29.176 |
| 5.573185367468112 | -0.758 | -4.878 | -29.304 |
| 5.579468552775292 | -0.762 | -4.901 | -29.431 |
| 5.585751738082471 | -0.766 | -4.924 | -29.557 |
| 5.59203492338965 | -0.771 | -4.946 | -29.683 |
| 5.59831810869683 | -0.775 | -4.968 | -29.807 |
| 5.604601294004008 | -0.778 | -4.991 | -29.932 |
| 5.610884479311188 | -0.782 | -5.013 | -30.055 |
| 5.617167664618367 | -0.786 | -5.035 | -30.178 |
| 5.623450849925546 | -0.79 | -5.056 | -30.3 |
| 5.629734035232725 | -0.794 | -5.078 | -30.422 |
| 5.636017220539904 | -0.798 | -5.099 | -30.542 |
| 5.642300405847083 | -0.802 | -5.121 | -30.662 |
| 5.648583591154263 | -0.805 | -5.142 | -30.782 |
| 5.654866776461442 | -0.809 | -5.163 | -30.9 |
| 5.661149961768621 | -0.813 | -5.183 | -31.018 |
| 5.6674331470758 | -0.816 | -5.204 | -31.135 |
| 5.673716332382979 | -0.82 | -5.225 | -31.251 |
| 5.679999517690159 | -0.824 | -5.245 | -31.366 |
| 5.686282702997337 | -0.827 | -5.265 | -31.481 |
| 5.692565888304517 | -0.831 | -5.285 | -31.595 |
| 5.698849073611696 | -0.834 | -5.305 | -31.708 |
| 5.705132258918875 | -0.838 | -5.325 | -31.82 |
| 5.711415444226055 | -0.841 | -5.344 | -31.931 |
| 5.717698629533234 | -0.844 | -5.363 | -32.042 |
| 5.723981814840413 | -0.848 | -5.383 | -32.151 |
| 5.730265000147592 | -0.851 | -5.402 | -32.26 |
| 5.73654818545477 | -0.854 | -5.42 | -32.368 |
| 5.742831370761951 | -0.858 | -5.439 | -32.475 |
| 5.74911455606913 | -0.861 | -5.458 | -32.581 |
| 5.75539774137631 | -0.864 | -5.476 | -32.686 |
| 5.761680926683488 | -0.867 | -5.494 | -32.791 |
| 5.767964111990667 | -0.87 | -5.512 | -32.894 |
| 5.774247297297846 | -0.873 | -5.53 | -32.997 |
| 5.780530482605025 | -0.876 | -5.547 | -33.098 |
| 5.786813667912205 | -0.879 | -5.565 | -33.199 |
| 5.793096853219384 | -0.882 | -5.582 | -33.299 |
| 5.799380038526563 | -0.885 | -5.599 | -33.398 |
| 5.805663223833742 | -0.888 | -5.616 | -33.495 |
| 5.811946409140922 | -0.891 | -5.632 | -33.592 |
| 5.8182295944481 | -0.894 | -5.649 | -33.688 |
| 5.82451277975528 | -0.897 | -5.665 | -33.783 |
| 5.830795965062459 | -0.899 | -5.681 | -33.877 |
| 5.837079150369638 | -0.902 | -5.697 | -33.97 |
| 5.843362335676817 | -0.905 | -5.713 | -34.062 |
| 5.849645520983997 | -0.907 | -5.729 | -34.152 |
| 5.855928706291176 | -0.91 | -5.744 | -34.242 |
| 5.862211891598355 | -0.913 | -5.759 | -34.331 |
| 5.868495076905535 | -0.915 | -5.774 | -34.419 |
| 5.874778262212714 | -0.918 | -5.789 | -34.505 |
| 5.881061447519893 | -0.92 | -5.803 | -34.591 |
| 5.887344632827072 | -0.923 | -5.818 | -34.675 |
| 5.893627818134251 | -0.925 | -5.832 | -34.759 |
| 5.899911003441431 | -0.927 | -5.846 | -34.841 |
| 5.90619418874861 | -0.93 | -5.86 | -34.922 |
| 5.912477374055789 | -0.932 | -5.873 | -35.003 |
| 5.918760559362968 | -0.934 | -5.886 | -35.082 |
| 5.925043744670147 | -0.937 | -5.9 | -35.159 |
| 5.931326929977326 | -0.939 | -5.913 | -35.236 |
| 5.937610115284505 | -0.941 | -5.925 | -35.312 |
| 5.943893300591684 | -0.943 | -5.938 | -35.386 |
| 5.950176485898864 | -0.945 | -5.95 | -35.46 |
| 5.956459671206043 | -0.947 | -5.962 | -35.532 |
| 5.962742856513223 | -0.949 | -5.974 | -35.603 |
| 5.969026041820402 | -0.951 | -5.986 | -35.672 |
| 5.975309227127581 | -0.953 | -5.997 | -35.741 |
| 5.98159241243476 | -0.955 | -6.009 | -35.808 |
| 5.987875597741939 | -0.957 | -6.02 | -35.875 |
| 5.994158783049118 | -0.959 | -6.031 | -35.939 |
| 6.000441968356298 | -0.96 | -6.041 | -36.003 |
| 6.006725153663476 | -0.962 | -6.052 | -36.066 |
| 6.013008338970656 | -0.964 | -6.062 | -36.127 |
| 6.019291524277835 | -0.965 | -6.072 | -36.187 |
| 6.025574709585015 | -0.967 | -6.082 | -36.246 |
| 6.031857894892193 | -0.969 | -6.091 | -36.303 |
| 6.038141080199372 | -0.97 | -6.1 | -36.359 |
| 6.044424265506552 | -0.972 | -6.109 | -36.414 |
| 6.050707450813731 | -0.973 | -6.118 | -36.468 |
| 6.05699063612091 | -0.975 | -6.127 | -36.52 |
| 6.06327382142809 | -0.976 | -6.135 | -36.571 |
| 6.069557006735269 | -0.977 | -6.144 | -36.621 |
| 6.075840192042448 | -0.979 | -6.152 | -36.67 |
| 6.082123377349627 | -0.98 | -6.159 | -36.717 |
| 6.088406562656806 | -0.981 | -6.167 | -36.762 |
| 6.094689747963986 | -0.982 | -6.174 | -36.807 |
| 6.100972933271164 | -0.983 | -6.181 | -36.85 |
| 6.107256118578344 | -0.985 | -6.188 | -36.892 |
| 6.113539303885523 | -0.986 | -6.195 | -36.932 |
| 6.119822489192702 | -0.987 | -6.201 | -36.971 |
| 6.126105674499882 | -0.988 | -6.207 | -37.008 |
| 6.132388859807061 | -0.989 | -6.213 | -37.045 |
| 6.13867204511424 | -0.99 | -6.219 | -37.079 |
| 6.144955230421419 | -0.99 | -6.224 | -37.113 |
| 6.151238415728598 | -0.991 | -6.229 | -37.145 |
| 6.157521601035778 | -0.992 | -6.234 | -37.175 |
| 6.163804786342957 | -0.993 | -6.239 | -37.204 |
| 6.170087971650136 | -0.994 | -6.244 | -37.232 |
| 6.176371156957315 | -0.994 | -6.248 | -37.258 |
| 6.182654342264494 | -0.995 | -6.252 | -37.283 |
| 6.188937527571674 | -0.996 | -6.256 | -37.307 |
| 6.195220712878853 | -0.996 | -6.259 | -37.329 |
| 6.201503898186032 | -0.997 | -6.262 | -37.349 |
| 6.207787083493211 | -0.997 | -6.265 | -37.368 |
| 6.21407026880039 | -0.998 | -6.268 | -37.386 |
| 6.22035345410757 | -0.998 | -6.271 | -37.402 |
| 6.226636639414749 | -0.998 | -6.273 | -37.416 |
| 6.232919824721928 | -0.999 | -6.275 | -37.429 |
| 6.239203010029107 | -0.999 | -6.277 | -37.441 |
| 6.245486195336286 | -0.999 | -6.279 | -37.451 |
| 6.251769380643465 | -1 | -6.28 | -37.459 |
| 6.258052565950644 | -1 | -6.281 | -37.466 |
| 6.264335751257824 | -1 | -6.282 | -37.471 |
| 6.270618936565003 | -1 | -6.283 | -37.475 |
| 6.276902121872182 | -1 | -6.283 | -37.478 |
| 6.283185307179361 | -1 | -6.283 | -37.478 |